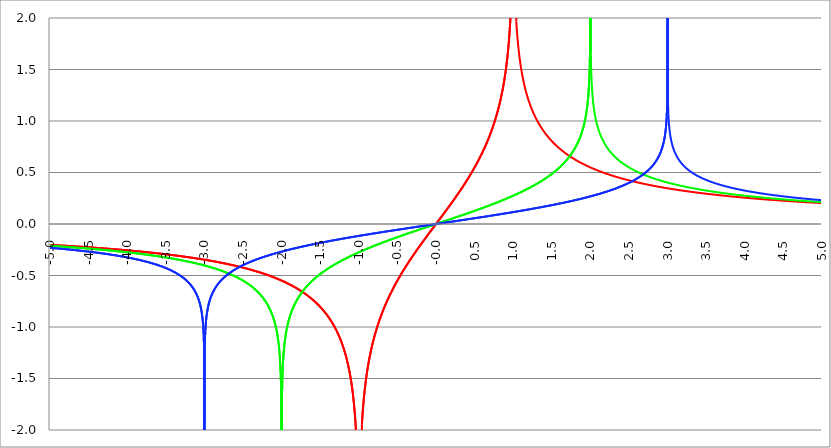
| Category | Series 1 | Series 0 | Series 2 |
|---|---|---|---|
| -5.0 | -0.203 | -0.212 | -0.231 |
| -4.995 | -0.203 | -0.212 | -0.231 |
| -4.99 | -0.203 | -0.212 | -0.232 |
| -4.985 | -0.203 | -0.213 | -0.232 |
| -4.98 | -0.204 | -0.213 | -0.232 |
| -4.975 | -0.204 | -0.213 | -0.233 |
| -4.97 | -0.204 | -0.213 | -0.233 |
| -4.965000000000001 | -0.204 | -0.214 | -0.233 |
| -4.960000000000001 | -0.204 | -0.214 | -0.234 |
| -4.955000000000001 | -0.205 | -0.214 | -0.234 |
| -4.950000000000001 | -0.205 | -0.214 | -0.234 |
| -4.945000000000001 | -0.205 | -0.214 | -0.235 |
| -4.940000000000001 | -0.205 | -0.215 | -0.235 |
| -4.935000000000001 | -0.205 | -0.215 | -0.235 |
| -4.930000000000001 | -0.206 | -0.215 | -0.236 |
| -4.925000000000002 | -0.206 | -0.215 | -0.236 |
| -4.920000000000002 | -0.206 | -0.216 | -0.236 |
| -4.915000000000002 | -0.206 | -0.216 | -0.237 |
| -4.910000000000002 | -0.207 | -0.216 | -0.237 |
| -4.905000000000002 | -0.207 | -0.216 | -0.237 |
| -4.900000000000002 | -0.207 | -0.217 | -0.238 |
| -4.895000000000002 | -0.207 | -0.217 | -0.238 |
| -4.890000000000002 | -0.207 | -0.217 | -0.238 |
| -4.885000000000002 | -0.208 | -0.217 | -0.239 |
| -4.880000000000002 | -0.208 | -0.218 | -0.239 |
| -4.875000000000003 | -0.208 | -0.218 | -0.239 |
| -4.870000000000003 | -0.208 | -0.218 | -0.24 |
| -4.865000000000003 | -0.209 | -0.218 | -0.24 |
| -4.860000000000003 | -0.209 | -0.219 | -0.24 |
| -4.855000000000003 | -0.209 | -0.219 | -0.241 |
| -4.850000000000003 | -0.209 | -0.219 | -0.241 |
| -4.845000000000003 | -0.209 | -0.219 | -0.241 |
| -4.840000000000003 | -0.21 | -0.22 | -0.242 |
| -4.835000000000003 | -0.21 | -0.22 | -0.242 |
| -4.830000000000004 | -0.21 | -0.22 | -0.242 |
| -4.825000000000004 | -0.21 | -0.221 | -0.243 |
| -4.820000000000004 | -0.211 | -0.221 | -0.243 |
| -4.815000000000004 | -0.211 | -0.221 | -0.243 |
| -4.810000000000004 | -0.211 | -0.221 | -0.244 |
| -4.805000000000004 | -0.211 | -0.222 | -0.244 |
| -4.800000000000004 | -0.211 | -0.222 | -0.244 |
| -4.795000000000004 | -0.212 | -0.222 | -0.245 |
| -4.790000000000004 | -0.212 | -0.222 | -0.245 |
| -4.785000000000004 | -0.212 | -0.223 | -0.245 |
| -4.780000000000004 | -0.212 | -0.223 | -0.246 |
| -4.775000000000004 | -0.213 | -0.223 | -0.246 |
| -4.770000000000004 | -0.213 | -0.223 | -0.247 |
| -4.765000000000005 | -0.213 | -0.224 | -0.247 |
| -4.760000000000005 | -0.213 | -0.224 | -0.247 |
| -4.755000000000005 | -0.213 | -0.224 | -0.248 |
| -4.750000000000005 | -0.214 | -0.224 | -0.248 |
| -4.745000000000005 | -0.214 | -0.225 | -0.248 |
| -4.740000000000005 | -0.214 | -0.225 | -0.249 |
| -4.735000000000005 | -0.214 | -0.225 | -0.249 |
| -4.730000000000005 | -0.215 | -0.226 | -0.249 |
| -4.725000000000006 | -0.215 | -0.226 | -0.25 |
| -4.720000000000006 | -0.215 | -0.226 | -0.25 |
| -4.715000000000006 | -0.215 | -0.226 | -0.251 |
| -4.710000000000006 | -0.216 | -0.227 | -0.251 |
| -4.705000000000006 | -0.216 | -0.227 | -0.251 |
| -4.700000000000006 | -0.216 | -0.227 | -0.252 |
| -4.695000000000006 | -0.216 | -0.227 | -0.252 |
| -4.690000000000006 | -0.217 | -0.228 | -0.253 |
| -4.685000000000007 | -0.217 | -0.228 | -0.253 |
| -4.680000000000007 | -0.217 | -0.228 | -0.253 |
| -4.675000000000007 | -0.217 | -0.229 | -0.254 |
| -4.670000000000007 | -0.217 | -0.229 | -0.254 |
| -4.665000000000007 | -0.218 | -0.229 | -0.254 |
| -4.660000000000007 | -0.218 | -0.229 | -0.255 |
| -4.655000000000007 | -0.218 | -0.23 | -0.255 |
| -4.650000000000007 | -0.218 | -0.23 | -0.256 |
| -4.645000000000007 | -0.219 | -0.23 | -0.256 |
| -4.640000000000008 | -0.219 | -0.231 | -0.256 |
| -4.635000000000008 | -0.219 | -0.231 | -0.257 |
| -4.630000000000008 | -0.219 | -0.231 | -0.257 |
| -4.625000000000008 | -0.22 | -0.231 | -0.258 |
| -4.620000000000008 | -0.22 | -0.232 | -0.258 |
| -4.615000000000008 | -0.22 | -0.232 | -0.258 |
| -4.610000000000008 | -0.22 | -0.232 | -0.259 |
| -4.605000000000008 | -0.221 | -0.233 | -0.259 |
| -4.600000000000008 | -0.221 | -0.233 | -0.26 |
| -4.595000000000009 | -0.221 | -0.233 | -0.26 |
| -4.590000000000009 | -0.221 | -0.233 | -0.261 |
| -4.585000000000009 | -0.222 | -0.234 | -0.261 |
| -4.580000000000009 | -0.222 | -0.234 | -0.261 |
| -4.57500000000001 | -0.222 | -0.234 | -0.262 |
| -4.57000000000001 | -0.222 | -0.235 | -0.262 |
| -4.565000000000009 | -0.223 | -0.235 | -0.263 |
| -4.560000000000009 | -0.223 | -0.235 | -0.263 |
| -4.555000000000009 | -0.223 | -0.236 | -0.263 |
| -4.55000000000001 | -0.223 | -0.236 | -0.264 |
| -4.54500000000001 | -0.224 | -0.236 | -0.264 |
| -4.54000000000001 | -0.224 | -0.236 | -0.265 |
| -4.53500000000001 | -0.224 | -0.237 | -0.265 |
| -4.53000000000001 | -0.224 | -0.237 | -0.266 |
| -4.52500000000001 | -0.225 | -0.237 | -0.266 |
| -4.52000000000001 | -0.225 | -0.238 | -0.266 |
| -4.51500000000001 | -0.225 | -0.238 | -0.267 |
| -4.51000000000001 | -0.225 | -0.238 | -0.267 |
| -4.505000000000011 | -0.226 | -0.239 | -0.268 |
| -4.500000000000011 | -0.226 | -0.239 | -0.268 |
| -4.495000000000011 | -0.226 | -0.239 | -0.269 |
| -4.490000000000011 | -0.227 | -0.239 | -0.269 |
| -4.485000000000011 | -0.227 | -0.24 | -0.27 |
| -4.480000000000011 | -0.227 | -0.24 | -0.27 |
| -4.475000000000011 | -0.227 | -0.24 | -0.27 |
| -4.470000000000011 | -0.228 | -0.241 | -0.271 |
| -4.465000000000011 | -0.228 | -0.241 | -0.271 |
| -4.460000000000011 | -0.228 | -0.241 | -0.272 |
| -4.455000000000012 | -0.228 | -0.242 | -0.272 |
| -4.450000000000012 | -0.229 | -0.242 | -0.273 |
| -4.445000000000012 | -0.229 | -0.242 | -0.273 |
| -4.440000000000012 | -0.229 | -0.243 | -0.274 |
| -4.435000000000012 | -0.229 | -0.243 | -0.274 |
| -4.430000000000012 | -0.23 | -0.243 | -0.275 |
| -4.425000000000012 | -0.23 | -0.244 | -0.275 |
| -4.420000000000012 | -0.23 | -0.244 | -0.276 |
| -4.415000000000012 | -0.23 | -0.244 | -0.276 |
| -4.410000000000013 | -0.231 | -0.245 | -0.277 |
| -4.405000000000013 | -0.231 | -0.245 | -0.277 |
| -4.400000000000013 | -0.231 | -0.245 | -0.278 |
| -4.395000000000013 | -0.232 | -0.246 | -0.278 |
| -4.390000000000013 | -0.232 | -0.246 | -0.278 |
| -4.385000000000013 | -0.232 | -0.246 | -0.279 |
| -4.380000000000013 | -0.232 | -0.247 | -0.279 |
| -4.375000000000013 | -0.233 | -0.247 | -0.28 |
| -4.370000000000013 | -0.233 | -0.247 | -0.28 |
| -4.365000000000013 | -0.233 | -0.248 | -0.281 |
| -4.360000000000014 | -0.234 | -0.248 | -0.281 |
| -4.355000000000014 | -0.234 | -0.248 | -0.282 |
| -4.350000000000014 | -0.234 | -0.249 | -0.282 |
| -4.345000000000014 | -0.234 | -0.249 | -0.283 |
| -4.340000000000014 | -0.235 | -0.249 | -0.283 |
| -4.335000000000014 | -0.235 | -0.25 | -0.284 |
| -4.330000000000014 | -0.235 | -0.25 | -0.284 |
| -4.325000000000014 | -0.235 | -0.25 | -0.285 |
| -4.320000000000014 | -0.236 | -0.251 | -0.285 |
| -4.315000000000015 | -0.236 | -0.251 | -0.286 |
| -4.310000000000015 | -0.236 | -0.251 | -0.287 |
| -4.305000000000015 | -0.237 | -0.252 | -0.287 |
| -4.300000000000015 | -0.237 | -0.252 | -0.288 |
| -4.295000000000015 | -0.237 | -0.252 | -0.288 |
| -4.290000000000015 | -0.237 | -0.253 | -0.289 |
| -4.285000000000015 | -0.238 | -0.253 | -0.289 |
| -4.280000000000015 | -0.238 | -0.253 | -0.29 |
| -4.275000000000015 | -0.238 | -0.254 | -0.29 |
| -4.270000000000015 | -0.239 | -0.254 | -0.291 |
| -4.265000000000016 | -0.239 | -0.254 | -0.291 |
| -4.260000000000016 | -0.239 | -0.255 | -0.292 |
| -4.255000000000016 | -0.239 | -0.255 | -0.292 |
| -4.250000000000016 | -0.24 | -0.255 | -0.293 |
| -4.245000000000016 | -0.24 | -0.256 | -0.294 |
| -4.240000000000016 | -0.24 | -0.256 | -0.294 |
| -4.235000000000016 | -0.241 | -0.256 | -0.295 |
| -4.230000000000016 | -0.241 | -0.257 | -0.295 |
| -4.225000000000017 | -0.241 | -0.257 | -0.296 |
| -4.220000000000017 | -0.242 | -0.258 | -0.296 |
| -4.215000000000017 | -0.242 | -0.258 | -0.297 |
| -4.210000000000017 | -0.242 | -0.258 | -0.297 |
| -4.205000000000017 | -0.242 | -0.259 | -0.298 |
| -4.200000000000017 | -0.243 | -0.259 | -0.299 |
| -4.195000000000017 | -0.243 | -0.259 | -0.299 |
| -4.190000000000017 | -0.243 | -0.26 | -0.3 |
| -4.185000000000017 | -0.244 | -0.26 | -0.3 |
| -4.180000000000017 | -0.244 | -0.26 | -0.301 |
| -4.175000000000018 | -0.244 | -0.261 | -0.302 |
| -4.170000000000018 | -0.245 | -0.261 | -0.302 |
| -4.165000000000018 | -0.245 | -0.262 | -0.303 |
| -4.160000000000018 | -0.245 | -0.262 | -0.303 |
| -4.155000000000018 | -0.245 | -0.262 | -0.304 |
| -4.150000000000018 | -0.246 | -0.263 | -0.305 |
| -4.145000000000018 | -0.246 | -0.263 | -0.305 |
| -4.140000000000018 | -0.246 | -0.264 | -0.306 |
| -4.135000000000018 | -0.247 | -0.264 | -0.306 |
| -4.130000000000019 | -0.247 | -0.264 | -0.307 |
| -4.125000000000019 | -0.247 | -0.265 | -0.308 |
| -4.120000000000019 | -0.248 | -0.265 | -0.308 |
| -4.115000000000019 | -0.248 | -0.265 | -0.309 |
| -4.110000000000019 | -0.248 | -0.266 | -0.31 |
| -4.105000000000019 | -0.249 | -0.266 | -0.31 |
| -4.100000000000019 | -0.249 | -0.267 | -0.311 |
| -4.095000000000019 | -0.249 | -0.267 | -0.311 |
| -4.090000000000019 | -0.25 | -0.267 | -0.312 |
| -4.085000000000019 | -0.25 | -0.268 | -0.313 |
| -4.08000000000002 | -0.25 | -0.268 | -0.313 |
| -4.07500000000002 | -0.251 | -0.269 | -0.314 |
| -4.07000000000002 | -0.251 | -0.269 | -0.315 |
| -4.06500000000002 | -0.251 | -0.269 | -0.315 |
| -4.06000000000002 | -0.251 | -0.27 | -0.316 |
| -4.05500000000002 | -0.252 | -0.27 | -0.317 |
| -4.05000000000002 | -0.252 | -0.271 | -0.317 |
| -4.04500000000002 | -0.252 | -0.271 | -0.318 |
| -4.04000000000002 | -0.253 | -0.271 | -0.319 |
| -4.03500000000002 | -0.253 | -0.272 | -0.319 |
| -4.03000000000002 | -0.253 | -0.272 | -0.32 |
| -4.025000000000021 | -0.254 | -0.273 | -0.321 |
| -4.020000000000021 | -0.254 | -0.273 | -0.321 |
| -4.015000000000021 | -0.254 | -0.273 | -0.322 |
| -4.010000000000021 | -0.255 | -0.274 | -0.323 |
| -4.005000000000021 | -0.255 | -0.274 | -0.324 |
| -4.000000000000021 | -0.255 | -0.275 | -0.324 |
| -3.995000000000021 | -0.256 | -0.275 | -0.325 |
| -3.990000000000021 | -0.256 | -0.275 | -0.326 |
| -3.985000000000022 | -0.256 | -0.276 | -0.326 |
| -3.980000000000022 | -0.257 | -0.276 | -0.327 |
| -3.975000000000022 | -0.257 | -0.277 | -0.328 |
| -3.970000000000022 | -0.257 | -0.277 | -0.329 |
| -3.965000000000022 | -0.258 | -0.278 | -0.329 |
| -3.960000000000022 | -0.258 | -0.278 | -0.33 |
| -3.955000000000022 | -0.258 | -0.278 | -0.331 |
| -3.950000000000022 | -0.259 | -0.279 | -0.332 |
| -3.945000000000022 | -0.259 | -0.279 | -0.332 |
| -3.940000000000023 | -0.259 | -0.28 | -0.333 |
| -3.935000000000023 | -0.26 | -0.28 | -0.334 |
| -3.930000000000023 | -0.26 | -0.281 | -0.335 |
| -3.925000000000023 | -0.261 | -0.281 | -0.336 |
| -3.920000000000023 | -0.261 | -0.282 | -0.336 |
| -3.915000000000023 | -0.261 | -0.282 | -0.337 |
| -3.910000000000023 | -0.262 | -0.282 | -0.338 |
| -3.905000000000023 | -0.262 | -0.283 | -0.339 |
| -3.900000000000023 | -0.262 | -0.283 | -0.339 |
| -3.895000000000023 | -0.263 | -0.284 | -0.34 |
| -3.890000000000024 | -0.263 | -0.284 | -0.341 |
| -3.885000000000024 | -0.263 | -0.285 | -0.342 |
| -3.880000000000024 | -0.264 | -0.285 | -0.343 |
| -3.875000000000024 | -0.264 | -0.286 | -0.344 |
| -3.870000000000024 | -0.264 | -0.286 | -0.344 |
| -3.865000000000024 | -0.265 | -0.286 | -0.345 |
| -3.860000000000024 | -0.265 | -0.287 | -0.346 |
| -3.855000000000024 | -0.265 | -0.287 | -0.347 |
| -3.850000000000024 | -0.266 | -0.288 | -0.348 |
| -3.845000000000025 | -0.266 | -0.288 | -0.349 |
| -3.840000000000025 | -0.267 | -0.289 | -0.35 |
| -3.835000000000025 | -0.267 | -0.289 | -0.35 |
| -3.830000000000025 | -0.267 | -0.29 | -0.351 |
| -3.825000000000025 | -0.268 | -0.29 | -0.352 |
| -3.820000000000025 | -0.268 | -0.291 | -0.353 |
| -3.815000000000025 | -0.268 | -0.291 | -0.354 |
| -3.810000000000025 | -0.269 | -0.292 | -0.355 |
| -3.805000000000025 | -0.269 | -0.292 | -0.356 |
| -3.800000000000026 | -0.269 | -0.293 | -0.357 |
| -3.795000000000026 | -0.27 | -0.293 | -0.358 |
| -3.790000000000026 | -0.27 | -0.293 | -0.359 |
| -3.785000000000026 | -0.271 | -0.294 | -0.359 |
| -3.780000000000026 | -0.271 | -0.294 | -0.36 |
| -3.775000000000026 | -0.271 | -0.295 | -0.361 |
| -3.770000000000026 | -0.272 | -0.295 | -0.362 |
| -3.765000000000026 | -0.272 | -0.296 | -0.363 |
| -3.760000000000026 | -0.273 | -0.296 | -0.364 |
| -3.755000000000026 | -0.273 | -0.297 | -0.365 |
| -3.750000000000027 | -0.273 | -0.297 | -0.366 |
| -3.745000000000027 | -0.274 | -0.298 | -0.367 |
| -3.740000000000027 | -0.274 | -0.298 | -0.368 |
| -3.735000000000027 | -0.274 | -0.299 | -0.369 |
| -3.730000000000027 | -0.275 | -0.299 | -0.37 |
| -3.725000000000027 | -0.275 | -0.3 | -0.371 |
| -3.720000000000027 | -0.276 | -0.3 | -0.372 |
| -3.715000000000027 | -0.276 | -0.301 | -0.373 |
| -3.710000000000027 | -0.276 | -0.301 | -0.374 |
| -3.705000000000028 | -0.277 | -0.302 | -0.375 |
| -3.700000000000028 | -0.277 | -0.302 | -0.376 |
| -3.695000000000028 | -0.278 | -0.303 | -0.378 |
| -3.690000000000028 | -0.278 | -0.303 | -0.379 |
| -3.685000000000028 | -0.278 | -0.304 | -0.38 |
| -3.680000000000028 | -0.279 | -0.305 | -0.381 |
| -3.675000000000028 | -0.279 | -0.305 | -0.382 |
| -3.670000000000028 | -0.28 | -0.306 | -0.383 |
| -3.665000000000028 | -0.28 | -0.306 | -0.384 |
| -3.660000000000028 | -0.28 | -0.307 | -0.385 |
| -3.655000000000029 | -0.281 | -0.307 | -0.386 |
| -3.650000000000029 | -0.281 | -0.308 | -0.388 |
| -3.645000000000029 | -0.282 | -0.308 | -0.389 |
| -3.640000000000029 | -0.282 | -0.309 | -0.39 |
| -3.635000000000029 | -0.282 | -0.309 | -0.391 |
| -3.630000000000029 | -0.283 | -0.31 | -0.392 |
| -3.625000000000029 | -0.283 | -0.31 | -0.393 |
| -3.620000000000029 | -0.284 | -0.311 | -0.395 |
| -3.615000000000029 | -0.284 | -0.312 | -0.396 |
| -3.61000000000003 | -0.284 | -0.312 | -0.397 |
| -3.60500000000003 | -0.285 | -0.313 | -0.398 |
| -3.60000000000003 | -0.285 | -0.313 | -0.4 |
| -3.59500000000003 | -0.286 | -0.314 | -0.401 |
| -3.59000000000003 | -0.286 | -0.314 | -0.402 |
| -3.58500000000003 | -0.287 | -0.315 | -0.403 |
| -3.58000000000003 | -0.287 | -0.315 | -0.405 |
| -3.57500000000003 | -0.287 | -0.316 | -0.406 |
| -3.57000000000003 | -0.288 | -0.317 | -0.407 |
| -3.565000000000031 | -0.288 | -0.317 | -0.409 |
| -3.560000000000031 | -0.289 | -0.318 | -0.41 |
| -3.555000000000031 | -0.289 | -0.318 | -0.412 |
| -3.550000000000031 | -0.29 | -0.319 | -0.413 |
| -3.545000000000031 | -0.29 | -0.319 | -0.414 |
| -3.540000000000031 | -0.29 | -0.32 | -0.416 |
| -3.535000000000031 | -0.291 | -0.321 | -0.417 |
| -3.530000000000031 | -0.291 | -0.321 | -0.419 |
| -3.525000000000031 | -0.292 | -0.322 | -0.42 |
| -3.520000000000032 | -0.292 | -0.322 | -0.421 |
| -3.515000000000032 | -0.293 | -0.323 | -0.423 |
| -3.510000000000032 | -0.293 | -0.324 | -0.424 |
| -3.505000000000032 | -0.293 | -0.324 | -0.426 |
| -3.500000000000032 | -0.294 | -0.325 | -0.427 |
| -3.495000000000032 | -0.294 | -0.325 | -0.429 |
| -3.490000000000032 | -0.295 | -0.326 | -0.431 |
| -3.485000000000032 | -0.295 | -0.327 | -0.432 |
| -3.480000000000032 | -0.296 | -0.327 | -0.434 |
| -3.475000000000032 | -0.296 | -0.328 | -0.435 |
| -3.470000000000033 | -0.297 | -0.329 | -0.437 |
| -3.465000000000033 | -0.297 | -0.329 | -0.439 |
| -3.460000000000033 | -0.297 | -0.33 | -0.44 |
| -3.455000000000033 | -0.298 | -0.33 | -0.442 |
| -3.450000000000033 | -0.298 | -0.331 | -0.444 |
| -3.445000000000033 | -0.299 | -0.332 | -0.445 |
| -3.440000000000033 | -0.299 | -0.332 | -0.447 |
| -3.435000000000033 | -0.3 | -0.333 | -0.449 |
| -3.430000000000033 | -0.3 | -0.334 | -0.451 |
| -3.425000000000034 | -0.301 | -0.334 | -0.453 |
| -3.420000000000034 | -0.301 | -0.335 | -0.454 |
| -3.415000000000034 | -0.302 | -0.336 | -0.456 |
| -3.410000000000034 | -0.302 | -0.336 | -0.458 |
| -3.405000000000034 | -0.303 | -0.337 | -0.46 |
| -3.400000000000034 | -0.303 | -0.337 | -0.462 |
| -3.395000000000034 | -0.304 | -0.338 | -0.464 |
| -3.390000000000034 | -0.304 | -0.339 | -0.466 |
| -3.385000000000034 | -0.304 | -0.339 | -0.468 |
| -3.380000000000034 | -0.305 | -0.34 | -0.47 |
| -3.375000000000035 | -0.305 | -0.341 | -0.472 |
| -3.370000000000035 | -0.306 | -0.342 | -0.474 |
| -3.365000000000035 | -0.306 | -0.342 | -0.476 |
| -3.360000000000035 | -0.307 | -0.343 | -0.479 |
| -3.355000000000035 | -0.307 | -0.344 | -0.481 |
| -3.350000000000035 | -0.308 | -0.344 | -0.483 |
| -3.345000000000035 | -0.308 | -0.345 | -0.485 |
| -3.340000000000035 | -0.309 | -0.346 | -0.488 |
| -3.335000000000035 | -0.309 | -0.346 | -0.49 |
| -3.330000000000036 | -0.31 | -0.347 | -0.492 |
| -3.325000000000036 | -0.31 | -0.348 | -0.495 |
| -3.320000000000036 | -0.311 | -0.348 | -0.497 |
| -3.315000000000036 | -0.311 | -0.349 | -0.5 |
| -3.310000000000036 | -0.312 | -0.35 | -0.502 |
| -3.305000000000036 | -0.312 | -0.351 | -0.505 |
| -3.300000000000036 | -0.313 | -0.351 | -0.507 |
| -3.295000000000036 | -0.313 | -0.352 | -0.51 |
| -3.290000000000036 | -0.314 | -0.353 | -0.513 |
| -3.285000000000036 | -0.314 | -0.354 | -0.516 |
| -3.280000000000036 | -0.315 | -0.354 | -0.518 |
| -3.275000000000037 | -0.315 | -0.355 | -0.521 |
| -3.270000000000037 | -0.316 | -0.356 | -0.524 |
| -3.265000000000037 | -0.316 | -0.357 | -0.527 |
| -3.260000000000037 | -0.317 | -0.357 | -0.53 |
| -3.255000000000037 | -0.317 | -0.358 | -0.533 |
| -3.250000000000037 | -0.318 | -0.359 | -0.536 |
| -3.245000000000037 | -0.319 | -0.36 | -0.54 |
| -3.240000000000037 | -0.319 | -0.36 | -0.543 |
| -3.235000000000038 | -0.32 | -0.361 | -0.546 |
| -3.230000000000038 | -0.32 | -0.362 | -0.55 |
| -3.225000000000038 | -0.321 | -0.363 | -0.553 |
| -3.220000000000038 | -0.321 | -0.363 | -0.557 |
| -3.215000000000038 | -0.322 | -0.364 | -0.561 |
| -3.210000000000038 | -0.322 | -0.365 | -0.564 |
| -3.205000000000038 | -0.323 | -0.366 | -0.568 |
| -3.200000000000038 | -0.323 | -0.367 | -0.572 |
| -3.195000000000038 | -0.324 | -0.367 | -0.576 |
| -3.190000000000039 | -0.324 | -0.368 | -0.581 |
| -3.185000000000039 | -0.325 | -0.369 | -0.585 |
| -3.180000000000039 | -0.325 | -0.37 | -0.589 |
| -3.175000000000039 | -0.326 | -0.371 | -0.594 |
| -3.170000000000039 | -0.327 | -0.371 | -0.599 |
| -3.16500000000004 | -0.327 | -0.372 | -0.603 |
| -3.16000000000004 | -0.328 | -0.373 | -0.608 |
| -3.155000000000039 | -0.328 | -0.374 | -0.614 |
| -3.150000000000039 | -0.329 | -0.375 | -0.619 |
| -3.14500000000004 | -0.329 | -0.376 | -0.624 |
| -3.14000000000004 | -0.33 | -0.377 | -0.63 |
| -3.13500000000004 | -0.331 | -0.377 | -0.636 |
| -3.13000000000004 | -0.331 | -0.378 | -0.642 |
| -3.12500000000004 | -0.332 | -0.379 | -0.649 |
| -3.12000000000004 | -0.332 | -0.38 | -0.655 |
| -3.11500000000004 | -0.333 | -0.381 | -0.662 |
| -3.11000000000004 | -0.333 | -0.382 | -0.67 |
| -3.10500000000004 | -0.334 | -0.383 | -0.677 |
| -3.10000000000004 | -0.335 | -0.383 | -0.685 |
| -3.095000000000041 | -0.335 | -0.384 | -0.694 |
| -3.090000000000041 | -0.336 | -0.385 | -0.702 |
| -3.085000000000041 | -0.336 | -0.386 | -0.712 |
| -3.080000000000041 | -0.337 | -0.387 | -0.722 |
| -3.075000000000041 | -0.337 | -0.388 | -0.732 |
| -3.070000000000041 | -0.338 | -0.389 | -0.744 |
| -3.065000000000041 | -0.339 | -0.39 | -0.756 |
| -3.060000000000041 | -0.339 | -0.391 | -0.769 |
| -3.055000000000041 | -0.34 | -0.392 | -0.784 |
| -3.050000000000042 | -0.34 | -0.393 | -0.799 |
| -3.045000000000042 | -0.341 | -0.394 | -0.817 |
| -3.040000000000042 | -0.342 | -0.395 | -0.836 |
| -3.035000000000042 | -0.342 | -0.396 | -0.858 |
| -3.030000000000042 | -0.343 | -0.396 | -0.884 |
| -3.025000000000042 | -0.343 | -0.397 | -0.914 |
| -3.020000000000042 | -0.344 | -0.398 | -0.951 |
| -3.015000000000042 | -0.345 | -0.399 | -0.999 |
| -3.010000000000042 | -0.345 | -0.4 | -1.066 |
| -3.005000000000043 | -0.346 | -0.401 | -1.182 |
| -3.000000000000043 | -0.347 | -0.402 | -5.43 |
| -2.995000000000043 | -0.347 | -0.403 | -1.182 |
| -2.990000000000043 | -0.348 | -0.404 | -1.066 |
| -2.985000000000043 | -0.348 | -0.405 | -0.998 |
| -2.980000000000043 | -0.349 | -0.406 | -0.95 |
| -2.975000000000043 | -0.35 | -0.407 | -0.913 |
| -2.970000000000043 | -0.35 | -0.408 | -0.882 |
| -2.965000000000043 | -0.351 | -0.41 | -0.856 |
| -2.960000000000043 | -0.352 | -0.411 | -0.834 |
| -2.955000000000044 | -0.352 | -0.412 | -0.814 |
| -2.950000000000044 | -0.353 | -0.413 | -0.797 |
| -2.945000000000044 | -0.354 | -0.414 | -0.78 |
| -2.940000000000044 | -0.354 | -0.415 | -0.766 |
| -2.935000000000044 | -0.355 | -0.416 | -0.752 |
| -2.930000000000044 | -0.356 | -0.417 | -0.74 |
| -2.925000000000044 | -0.356 | -0.418 | -0.728 |
| -2.920000000000044 | -0.357 | -0.419 | -0.717 |
| -2.915000000000044 | -0.358 | -0.42 | -0.707 |
| -2.910000000000045 | -0.358 | -0.421 | -0.697 |
| -2.905000000000045 | -0.359 | -0.423 | -0.688 |
| -2.900000000000045 | -0.36 | -0.424 | -0.68 |
| -2.895000000000045 | -0.36 | -0.425 | -0.671 |
| -2.890000000000045 | -0.361 | -0.426 | -0.663 |
| -2.885000000000045 | -0.362 | -0.427 | -0.656 |
| -2.880000000000045 | -0.362 | -0.428 | -0.649 |
| -2.875000000000045 | -0.363 | -0.429 | -0.642 |
| -2.870000000000045 | -0.364 | -0.431 | -0.635 |
| -2.865000000000045 | -0.364 | -0.432 | -0.629 |
| -2.860000000000046 | -0.365 | -0.433 | -0.622 |
| -2.855000000000046 | -0.366 | -0.434 | -0.616 |
| -2.850000000000046 | -0.366 | -0.435 | -0.611 |
| -2.845000000000046 | -0.367 | -0.437 | -0.605 |
| -2.840000000000046 | -0.368 | -0.438 | -0.6 |
| -2.835000000000046 | -0.369 | -0.439 | -0.594 |
| -2.830000000000046 | -0.369 | -0.44 | -0.589 |
| -2.825000000000046 | -0.37 | -0.442 | -0.584 |
| -2.820000000000046 | -0.371 | -0.443 | -0.579 |
| -2.815000000000047 | -0.371 | -0.444 | -0.575 |
| -2.810000000000047 | -0.372 | -0.445 | -0.57 |
| -2.805000000000047 | -0.373 | -0.447 | -0.566 |
| -2.800000000000047 | -0.374 | -0.448 | -0.561 |
| -2.795000000000047 | -0.374 | -0.449 | -0.557 |
| -2.790000000000047 | -0.375 | -0.451 | -0.553 |
| -2.785000000000047 | -0.376 | -0.452 | -0.549 |
| -2.780000000000047 | -0.377 | -0.453 | -0.545 |
| -2.775000000000047 | -0.377 | -0.455 | -0.541 |
| -2.770000000000047 | -0.378 | -0.456 | -0.537 |
| -2.765000000000048 | -0.379 | -0.457 | -0.533 |
| -2.760000000000048 | -0.38 | -0.459 | -0.53 |
| -2.755000000000048 | -0.38 | -0.46 | -0.526 |
| -2.750000000000048 | -0.381 | -0.461 | -0.523 |
| -2.745000000000048 | -0.382 | -0.463 | -0.519 |
| -2.740000000000048 | -0.383 | -0.464 | -0.516 |
| -2.735000000000048 | -0.383 | -0.466 | -0.512 |
| -2.730000000000048 | -0.384 | -0.467 | -0.509 |
| -2.725000000000048 | -0.385 | -0.469 | -0.506 |
| -2.720000000000049 | -0.386 | -0.47 | -0.503 |
| -2.715000000000049 | -0.386 | -0.472 | -0.5 |
| -2.710000000000049 | -0.387 | -0.473 | -0.497 |
| -2.705000000000049 | -0.388 | -0.475 | -0.494 |
| -2.700000000000049 | -0.389 | -0.476 | -0.491 |
| -2.695000000000049 | -0.39 | -0.478 | -0.488 |
| -2.690000000000049 | -0.39 | -0.479 | -0.485 |
| -2.685000000000049 | -0.391 | -0.481 | -0.482 |
| -2.680000000000049 | -0.392 | -0.482 | -0.479 |
| -2.675000000000049 | -0.393 | -0.484 | -0.477 |
| -2.67000000000005 | -0.394 | -0.485 | -0.474 |
| -2.66500000000005 | -0.395 | -0.487 | -0.471 |
| -2.66000000000005 | -0.395 | -0.489 | -0.469 |
| -2.65500000000005 | -0.396 | -0.49 | -0.466 |
| -2.65000000000005 | -0.397 | -0.492 | -0.464 |
| -2.64500000000005 | -0.398 | -0.494 | -0.461 |
| -2.64000000000005 | -0.399 | -0.495 | -0.459 |
| -2.63500000000005 | -0.399 | -0.497 | -0.456 |
| -2.63000000000005 | -0.4 | -0.499 | -0.454 |
| -2.625000000000051 | -0.401 | -0.5 | -0.451 |
| -2.620000000000051 | -0.402 | -0.502 | -0.449 |
| -2.615000000000051 | -0.403 | -0.504 | -0.447 |
| -2.610000000000051 | -0.404 | -0.506 | -0.444 |
| -2.605000000000051 | -0.405 | -0.507 | -0.442 |
| -2.600000000000051 | -0.405 | -0.509 | -0.44 |
| -2.595000000000051 | -0.406 | -0.511 | -0.438 |
| -2.590000000000051 | -0.407 | -0.513 | -0.435 |
| -2.585000000000051 | -0.408 | -0.515 | -0.433 |
| -2.580000000000052 | -0.409 | -0.517 | -0.431 |
| -2.575000000000052 | -0.41 | -0.518 | -0.429 |
| -2.570000000000052 | -0.411 | -0.52 | -0.427 |
| -2.565000000000052 | -0.412 | -0.522 | -0.425 |
| -2.560000000000052 | -0.413 | -0.524 | -0.423 |
| -2.555000000000052 | -0.413 | -0.526 | -0.421 |
| -2.550000000000052 | -0.414 | -0.528 | -0.419 |
| -2.545000000000052 | -0.415 | -0.53 | -0.417 |
| -2.540000000000052 | -0.416 | -0.532 | -0.415 |
| -2.535000000000053 | -0.417 | -0.534 | -0.413 |
| -2.530000000000053 | -0.418 | -0.536 | -0.411 |
| -2.525000000000053 | -0.419 | -0.538 | -0.409 |
| -2.520000000000053 | -0.42 | -0.541 | -0.407 |
| -2.515000000000053 | -0.421 | -0.543 | -0.405 |
| -2.510000000000053 | -0.422 | -0.545 | -0.403 |
| -2.505000000000053 | -0.423 | -0.547 | -0.401 |
| -2.500000000000053 | -0.424 | -0.549 | -0.4 |
| -2.495000000000053 | -0.425 | -0.552 | -0.398 |
| -2.490000000000053 | -0.426 | -0.554 | -0.396 |
| -2.485000000000054 | -0.427 | -0.556 | -0.394 |
| -2.480000000000054 | -0.427 | -0.558 | -0.393 |
| -2.475000000000054 | -0.428 | -0.561 | -0.391 |
| -2.470000000000054 | -0.429 | -0.563 | -0.389 |
| -2.465000000000054 | -0.43 | -0.565 | -0.387 |
| -2.460000000000054 | -0.431 | -0.568 | -0.386 |
| -2.455000000000054 | -0.432 | -0.57 | -0.384 |
| -2.450000000000054 | -0.433 | -0.573 | -0.382 |
| -2.445000000000054 | -0.434 | -0.575 | -0.381 |
| -2.440000000000055 | -0.435 | -0.578 | -0.379 |
| -2.435000000000055 | -0.436 | -0.58 | -0.377 |
| -2.430000000000055 | -0.437 | -0.583 | -0.376 |
| -2.425000000000055 | -0.438 | -0.586 | -0.374 |
| -2.420000000000055 | -0.439 | -0.588 | -0.372 |
| -2.415000000000055 | -0.441 | -0.591 | -0.371 |
| -2.410000000000055 | -0.442 | -0.594 | -0.369 |
| -2.405000000000055 | -0.443 | -0.597 | -0.368 |
| -2.400000000000055 | -0.444 | -0.599 | -0.366 |
| -2.395000000000055 | -0.445 | -0.602 | -0.365 |
| -2.390000000000056 | -0.446 | -0.605 | -0.363 |
| -2.385000000000056 | -0.447 | -0.608 | -0.362 |
| -2.380000000000056 | -0.448 | -0.611 | -0.36 |
| -2.375000000000056 | -0.449 | -0.614 | -0.359 |
| -2.370000000000056 | -0.45 | -0.617 | -0.357 |
| -2.365000000000056 | -0.451 | -0.62 | -0.356 |
| -2.360000000000056 | -0.452 | -0.624 | -0.354 |
| -2.355000000000056 | -0.453 | -0.627 | -0.353 |
| -2.350000000000056 | -0.454 | -0.63 | -0.351 |
| -2.345000000000057 | -0.456 | -0.633 | -0.35 |
| -2.340000000000057 | -0.457 | -0.637 | -0.348 |
| -2.335000000000057 | -0.458 | -0.64 | -0.347 |
| -2.330000000000057 | -0.459 | -0.644 | -0.346 |
| -2.325000000000057 | -0.46 | -0.647 | -0.344 |
| -2.320000000000057 | -0.461 | -0.651 | -0.343 |
| -2.315000000000057 | -0.462 | -0.654 | -0.341 |
| -2.310000000000057 | -0.463 | -0.658 | -0.34 |
| -2.305000000000057 | -0.465 | -0.662 | -0.339 |
| -2.300000000000058 | -0.466 | -0.666 | -0.337 |
| -2.295000000000058 | -0.467 | -0.67 | -0.336 |
| -2.290000000000058 | -0.468 | -0.674 | -0.335 |
| -2.285000000000058 | -0.469 | -0.678 | -0.333 |
| -2.280000000000058 | -0.47 | -0.682 | -0.332 |
| -2.275000000000058 | -0.472 | -0.686 | -0.331 |
| -2.270000000000058 | -0.473 | -0.69 | -0.329 |
| -2.265000000000058 | -0.474 | -0.695 | -0.328 |
| -2.260000000000058 | -0.475 | -0.699 | -0.327 |
| -2.255000000000058 | -0.477 | -0.704 | -0.326 |
| -2.250000000000059 | -0.478 | -0.708 | -0.324 |
| -2.245000000000059 | -0.479 | -0.713 | -0.323 |
| -2.240000000000059 | -0.48 | -0.718 | -0.322 |
| -2.235000000000059 | -0.481 | -0.723 | -0.321 |
| -2.23000000000006 | -0.483 | -0.728 | -0.319 |
| -2.22500000000006 | -0.484 | -0.733 | -0.318 |
| -2.22000000000006 | -0.485 | -0.738 | -0.317 |
| -2.215000000000059 | -0.487 | -0.744 | -0.316 |
| -2.210000000000059 | -0.488 | -0.75 | -0.314 |
| -2.20500000000006 | -0.489 | -0.755 | -0.313 |
| -2.20000000000006 | -0.49 | -0.761 | -0.312 |
| -2.19500000000006 | -0.492 | -0.767 | -0.311 |
| -2.19000000000006 | -0.493 | -0.773 | -0.31 |
| -2.18500000000006 | -0.494 | -0.78 | -0.308 |
| -2.18000000000006 | -0.496 | -0.786 | -0.307 |
| -2.17500000000006 | -0.497 | -0.793 | -0.306 |
| -2.17000000000006 | -0.498 | -0.8 | -0.305 |
| -2.16500000000006 | -0.5 | -0.807 | -0.304 |
| -2.160000000000061 | -0.501 | -0.815 | -0.303 |
| -2.155000000000061 | -0.502 | -0.822 | -0.301 |
| -2.150000000000061 | -0.504 | -0.83 | -0.3 |
| -2.145000000000061 | -0.505 | -0.838 | -0.299 |
| -2.140000000000061 | -0.507 | -0.847 | -0.298 |
| -2.135000000000061 | -0.508 | -0.855 | -0.297 |
| -2.130000000000061 | -0.509 | -0.865 | -0.296 |
| -2.125000000000061 | -0.511 | -0.874 | -0.295 |
| -2.120000000000061 | -0.512 | -0.884 | -0.293 |
| -2.115000000000061 | -0.514 | -0.894 | -0.292 |
| -2.110000000000062 | -0.515 | -0.905 | -0.291 |
| -2.105000000000062 | -0.517 | -0.917 | -0.29 |
| -2.100000000000062 | -0.518 | -0.928 | -0.289 |
| -2.095000000000062 | -0.52 | -0.941 | -0.288 |
| -2.090000000000062 | -0.521 | -0.954 | -0.287 |
| -2.085000000000062 | -0.522 | -0.968 | -0.286 |
| -2.080000000000062 | -0.524 | -0.983 | -0.285 |
| -2.075000000000062 | -0.525 | -0.999 | -0.284 |
| -2.070000000000062 | -0.527 | -1.016 | -0.283 |
| -2.065000000000063 | -0.529 | -1.034 | -0.282 |
| -2.060000000000063 | -0.53 | -1.054 | -0.281 |
| -2.055000000000063 | -0.532 | -1.075 | -0.279 |
| -2.050000000000063 | -0.533 | -1.099 | -0.278 |
| -2.045000000000063 | -0.535 | -1.125 | -0.277 |
| -2.040000000000063 | -0.536 | -1.154 | -0.276 |
| -2.035000000000063 | -0.538 | -1.187 | -0.275 |
| -2.030000000000063 | -0.54 | -1.225 | -0.274 |
| -2.025000000000063 | -0.541 | -1.27 | -0.273 |
| -2.020000000000064 | -0.543 | -1.326 | -0.272 |
| -2.015000000000064 | -0.544 | -1.397 | -0.271 |
| -2.010000000000064 | -0.546 | -1.498 | -0.27 |
| -2.005000000000064 | -0.548 | -1.671 | -0.269 |
| -2.000000000000064 | -0.549 | -7.942 | -0.268 |
| -1.995000000000064 | -0.551 | -1.671 | -0.267 |
| -1.990000000000064 | -0.553 | -1.497 | -0.266 |
| -1.985000000000064 | -0.554 | -1.396 | -0.265 |
| -1.980000000000064 | -0.556 | -1.323 | -0.264 |
| -1.975000000000064 | -0.558 | -1.267 | -0.263 |
| -1.970000000000065 | -0.56 | -1.221 | -0.262 |
| -1.965000000000065 | -0.561 | -1.182 | -0.261 |
| -1.960000000000065 | -0.563 | -1.149 | -0.26 |
| -1.955000000000065 | -0.565 | -1.119 | -0.259 |
| -1.950000000000065 | -0.567 | -1.092 | -0.258 |
| -1.945000000000065 | -0.568 | -1.068 | -0.257 |
| -1.940000000000065 | -0.57 | -1.046 | -0.257 |
| -1.935000000000065 | -0.572 | -1.026 | -0.256 |
| -1.930000000000065 | -0.574 | -1.007 | -0.255 |
| -1.925000000000066 | -0.576 | -0.989 | -0.254 |
| -1.920000000000066 | -0.577 | -0.973 | -0.253 |
| -1.915000000000066 | -0.579 | -0.957 | -0.252 |
| -1.910000000000066 | -0.581 | -0.943 | -0.251 |
| -1.905000000000066 | -0.583 | -0.929 | -0.25 |
| -1.900000000000066 | -0.585 | -0.916 | -0.249 |
| -1.895000000000066 | -0.587 | -0.903 | -0.248 |
| -1.890000000000066 | -0.589 | -0.891 | -0.247 |
| -1.885000000000066 | -0.591 | -0.88 | -0.246 |
| -1.880000000000066 | -0.593 | -0.869 | -0.245 |
| -1.875000000000067 | -0.595 | -0.858 | -0.244 |
| -1.870000000000067 | -0.597 | -0.848 | -0.243 |
| -1.865000000000067 | -0.599 | -0.839 | -0.243 |
| -1.860000000000067 | -0.601 | -0.829 | -0.242 |
| -1.855000000000067 | -0.603 | -0.82 | -0.241 |
| -1.850000000000067 | -0.605 | -0.811 | -0.24 |
| -1.845000000000067 | -0.607 | -0.803 | -0.239 |
| -1.840000000000067 | -0.609 | -0.795 | -0.238 |
| -1.835000000000067 | -0.611 | -0.786 | -0.237 |
| -1.830000000000068 | -0.613 | -0.779 | -0.236 |
| -1.825000000000068 | -0.615 | -0.771 | -0.235 |
| -1.820000000000068 | -0.618 | -0.764 | -0.235 |
| -1.815000000000068 | -0.62 | -0.757 | -0.234 |
| -1.810000000000068 | -0.622 | -0.75 | -0.233 |
| -1.805000000000068 | -0.624 | -0.743 | -0.232 |
| -1.800000000000068 | -0.626 | -0.736 | -0.231 |
| -1.795000000000068 | -0.629 | -0.73 | -0.23 |
| -1.790000000000068 | -0.631 | -0.723 | -0.229 |
| -1.785000000000068 | -0.633 | -0.717 | -0.228 |
| -1.780000000000069 | -0.635 | -0.711 | -0.228 |
| -1.775000000000069 | -0.638 | -0.705 | -0.227 |
| -1.770000000000069 | -0.64 | -0.699 | -0.226 |
| -1.765000000000069 | -0.642 | -0.693 | -0.225 |
| -1.760000000000069 | -0.645 | -0.688 | -0.224 |
| -1.75500000000007 | -0.647 | -0.682 | -0.223 |
| -1.75000000000007 | -0.65 | -0.677 | -0.223 |
| -1.745000000000069 | -0.652 | -0.672 | -0.222 |
| -1.740000000000069 | -0.655 | -0.667 | -0.221 |
| -1.73500000000007 | -0.657 | -0.661 | -0.22 |
| -1.73000000000007 | -0.66 | -0.656 | -0.219 |
| -1.72500000000007 | -0.662 | -0.652 | -0.218 |
| -1.72000000000007 | -0.665 | -0.647 | -0.217 |
| -1.71500000000007 | -0.667 | -0.642 | -0.217 |
| -1.71000000000007 | -0.67 | -0.637 | -0.216 |
| -1.70500000000007 | -0.672 | -0.633 | -0.215 |
| -1.70000000000007 | -0.675 | -0.628 | -0.214 |
| -1.69500000000007 | -0.678 | -0.624 | -0.213 |
| -1.69000000000007 | -0.68 | -0.619 | -0.213 |
| -1.685000000000071 | -0.683 | -0.615 | -0.212 |
| -1.680000000000071 | -0.686 | -0.611 | -0.211 |
| -1.675000000000071 | -0.688 | -0.606 | -0.21 |
| -1.670000000000071 | -0.691 | -0.602 | -0.209 |
| -1.665000000000071 | -0.694 | -0.598 | -0.209 |
| -1.660000000000071 | -0.697 | -0.594 | -0.208 |
| -1.655000000000071 | -0.7 | -0.59 | -0.207 |
| -1.650000000000071 | -0.703 | -0.586 | -0.206 |
| -1.645000000000071 | -0.706 | -0.582 | -0.205 |
| -1.640000000000072 | -0.709 | -0.578 | -0.205 |
| -1.635000000000072 | -0.712 | -0.575 | -0.204 |
| -1.630000000000072 | -0.715 | -0.571 | -0.203 |
| -1.625000000000072 | -0.718 | -0.567 | -0.202 |
| -1.620000000000072 | -0.721 | -0.564 | -0.201 |
| -1.615000000000072 | -0.724 | -0.56 | -0.201 |
| -1.610000000000072 | -0.727 | -0.556 | -0.2 |
| -1.605000000000072 | -0.73 | -0.553 | -0.199 |
| -1.600000000000072 | -0.733 | -0.549 | -0.198 |
| -1.595000000000073 | -0.736 | -0.546 | -0.197 |
| -1.590000000000073 | -0.74 | -0.542 | -0.197 |
| -1.585000000000073 | -0.743 | -0.539 | -0.196 |
| -1.580000000000073 | -0.746 | -0.536 | -0.195 |
| -1.575000000000073 | -0.75 | -0.532 | -0.194 |
| -1.570000000000073 | -0.753 | -0.529 | -0.194 |
| -1.565000000000073 | -0.756 | -0.526 | -0.193 |
| -1.560000000000073 | -0.76 | -0.523 | -0.192 |
| -1.555000000000073 | -0.763 | -0.52 | -0.191 |
| -1.550000000000074 | -0.767 | -0.516 | -0.191 |
| -1.545000000000074 | -0.771 | -0.513 | -0.19 |
| -1.540000000000074 | -0.774 | -0.51 | -0.189 |
| -1.535000000000074 | -0.778 | -0.507 | -0.188 |
| -1.530000000000074 | -0.782 | -0.504 | -0.188 |
| -1.525000000000074 | -0.785 | -0.501 | -0.187 |
| -1.520000000000074 | -0.789 | -0.498 | -0.186 |
| -1.515000000000074 | -0.793 | -0.495 | -0.185 |
| -1.510000000000074 | -0.797 | -0.492 | -0.185 |
| -1.505000000000074 | -0.801 | -0.489 | -0.184 |
| -1.500000000000075 | -0.805 | -0.486 | -0.183 |
| -1.495000000000075 | -0.809 | -0.484 | -0.182 |
| -1.490000000000075 | -0.813 | -0.481 | -0.182 |
| -1.485000000000075 | -0.817 | -0.478 | -0.181 |
| -1.480000000000075 | -0.821 | -0.475 | -0.18 |
| -1.475000000000075 | -0.825 | -0.472 | -0.179 |
| -1.470000000000075 | -0.83 | -0.47 | -0.179 |
| -1.465000000000075 | -0.834 | -0.467 | -0.178 |
| -1.460000000000075 | -0.838 | -0.464 | -0.177 |
| -1.455000000000076 | -0.843 | -0.462 | -0.177 |
| -1.450000000000076 | -0.847 | -0.459 | -0.176 |
| -1.445000000000076 | -0.852 | -0.456 | -0.175 |
| -1.440000000000076 | -0.856 | -0.454 | -0.174 |
| -1.435000000000076 | -0.861 | -0.451 | -0.174 |
| -1.430000000000076 | -0.866 | -0.449 | -0.173 |
| -1.425000000000076 | -0.871 | -0.446 | -0.172 |
| -1.420000000000076 | -0.876 | -0.444 | -0.171 |
| -1.415000000000076 | -0.881 | -0.441 | -0.171 |
| -1.410000000000077 | -0.886 | -0.439 | -0.17 |
| -1.405000000000077 | -0.891 | -0.436 | -0.169 |
| -1.400000000000077 | -0.896 | -0.434 | -0.169 |
| -1.395000000000077 | -0.901 | -0.431 | -0.168 |
| -1.390000000000077 | -0.906 | -0.429 | -0.167 |
| -1.385000000000077 | -0.912 | -0.426 | -0.166 |
| -1.380000000000077 | -0.917 | -0.424 | -0.166 |
| -1.375000000000077 | -0.923 | -0.422 | -0.165 |
| -1.370000000000077 | -0.929 | -0.419 | -0.164 |
| -1.365000000000077 | -0.934 | -0.417 | -0.164 |
| -1.360000000000078 | -0.94 | -0.415 | -0.163 |
| -1.355000000000078 | -0.946 | -0.412 | -0.162 |
| -1.350000000000078 | -0.952 | -0.41 | -0.162 |
| -1.345000000000078 | -0.958 | -0.408 | -0.161 |
| -1.340000000000078 | -0.964 | -0.405 | -0.16 |
| -1.335000000000078 | -0.971 | -0.403 | -0.159 |
| -1.330000000000078 | -0.977 | -0.401 | -0.159 |
| -1.325000000000078 | -0.984 | -0.399 | -0.158 |
| -1.320000000000078 | -0.991 | -0.396 | -0.157 |
| -1.315000000000079 | -0.997 | -0.394 | -0.157 |
| -1.310000000000079 | -1.004 | -0.392 | -0.156 |
| -1.305000000000079 | -1.011 | -0.39 | -0.155 |
| -1.300000000000079 | -1.018 | -0.388 | -0.155 |
| -1.295000000000079 | -1.026 | -0.385 | -0.154 |
| -1.29000000000008 | -1.033 | -0.383 | -0.153 |
| -1.285000000000079 | -1.041 | -0.381 | -0.153 |
| -1.280000000000079 | -1.049 | -0.379 | -0.152 |
| -1.275000000000079 | -1.056 | -0.377 | -0.151 |
| -1.270000000000079 | -1.065 | -0.375 | -0.151 |
| -1.26500000000008 | -1.073 | -0.373 | -0.15 |
| -1.26000000000008 | -1.081 | -0.371 | -0.149 |
| -1.25500000000008 | -1.09 | -0.369 | -0.149 |
| -1.25000000000008 | -1.099 | -0.367 | -0.148 |
| -1.24500000000008 | -1.108 | -0.365 | -0.147 |
| -1.24000000000008 | -1.117 | -0.363 | -0.147 |
| -1.23500000000008 | -1.126 | -0.36 | -0.146 |
| -1.23000000000008 | -1.136 | -0.358 | -0.145 |
| -1.22500000000008 | -1.146 | -0.356 | -0.145 |
| -1.220000000000081 | -1.156 | -0.354 | -0.144 |
| -1.215000000000081 | -1.166 | -0.352 | -0.143 |
| -1.210000000000081 | -1.177 | -0.35 | -0.143 |
| -1.205000000000081 | -1.188 | -0.349 | -0.142 |
| -1.200000000000081 | -1.199 | -0.347 | -0.141 |
| -1.195000000000081 | -1.21 | -0.345 | -0.141 |
| -1.190000000000081 | -1.222 | -0.343 | -0.14 |
| -1.185000000000081 | -1.235 | -0.341 | -0.139 |
| -1.180000000000081 | -1.247 | -0.339 | -0.139 |
| -1.175000000000082 | -1.26 | -0.337 | -0.138 |
| -1.170000000000082 | -1.273 | -0.335 | -0.137 |
| -1.165000000000082 | -1.287 | -0.333 | -0.137 |
| -1.160000000000082 | -1.301 | -0.331 | -0.136 |
| -1.155000000000082 | -1.316 | -0.329 | -0.135 |
| -1.150000000000082 | -1.331 | -0.327 | -0.135 |
| -1.145000000000082 | -1.347 | -0.326 | -0.134 |
| -1.140000000000082 | -1.363 | -0.324 | -0.133 |
| -1.135000000000082 | -1.38 | -0.322 | -0.133 |
| -1.130000000000082 | -1.398 | -0.32 | -0.132 |
| -1.125000000000083 | -1.417 | -0.318 | -0.131 |
| -1.120000000000083 | -1.436 | -0.316 | -0.131 |
| -1.115000000000083 | -1.456 | -0.315 | -0.13 |
| -1.110000000000083 | -1.477 | -0.313 | -0.129 |
| -1.105000000000083 | -1.499 | -0.311 | -0.129 |
| -1.100000000000083 | -1.522 | -0.309 | -0.128 |
| -1.095000000000083 | -1.547 | -0.307 | -0.128 |
| -1.090000000000083 | -1.573 | -0.306 | -0.127 |
| -1.085000000000083 | -1.6 | -0.304 | -0.126 |
| -1.080000000000084 | -1.629 | -0.302 | -0.126 |
| -1.075000000000084 | -1.66 | -0.3 | -0.125 |
| -1.070000000000084 | -1.693 | -0.299 | -0.124 |
| -1.065000000000084 | -1.729 | -0.297 | -0.124 |
| -1.060000000000084 | -1.768 | -0.295 | -0.123 |
| -1.055000000000084 | -1.81 | -0.293 | -0.122 |
| -1.050000000000084 | -1.857 | -0.292 | -0.122 |
| -1.045000000000084 | -1.908 | -0.29 | -0.121 |
| -1.040000000000084 | -1.966 | -0.288 | -0.121 |
| -1.035000000000085 | -2.031 | -0.286 | -0.12 |
| -1.030000000000085 | -2.107 | -0.285 | -0.119 |
| -1.025000000000085 | -2.197 | -0.283 | -0.119 |
| -1.020000000000085 | -2.308 | -0.281 | -0.118 |
| -1.015000000000085 | -2.45 | -0.28 | -0.117 |
| -1.010000000000085 | -2.652 | -0.278 | -0.117 |
| -1.005000000000085 | -2.997 | -0.276 | -0.116 |
| -1.000000000000085 | -15.393 | -0.275 | -0.116 |
| -0.995000000000085 | -2.994 | -0.273 | -0.115 |
| -0.990000000000085 | -2.647 | -0.271 | -0.114 |
| -0.985000000000085 | -2.443 | -0.27 | -0.114 |
| -0.980000000000085 | -2.298 | -0.268 | -0.113 |
| -0.975000000000085 | -2.185 | -0.266 | -0.112 |
| -0.970000000000085 | -2.092 | -0.265 | -0.112 |
| -0.965000000000085 | -2.014 | -0.263 | -0.111 |
| -0.960000000000085 | -1.946 | -0.261 | -0.111 |
| -0.955000000000085 | -1.886 | -0.26 | -0.11 |
| -0.950000000000085 | -1.832 | -0.258 | -0.109 |
| -0.945000000000085 | -1.783 | -0.257 | -0.109 |
| -0.940000000000085 | -1.738 | -0.255 | -0.108 |
| -0.935000000000085 | -1.697 | -0.253 | -0.107 |
| -0.930000000000085 | -1.658 | -0.252 | -0.107 |
| -0.925000000000085 | -1.623 | -0.25 | -0.106 |
| -0.920000000000085 | -1.589 | -0.249 | -0.106 |
| -0.915000000000085 | -1.557 | -0.247 | -0.105 |
| -0.910000000000085 | -1.528 | -0.245 | -0.104 |
| -0.905000000000085 | -1.499 | -0.244 | -0.104 |
| -0.900000000000085 | -1.472 | -0.242 | -0.103 |
| -0.895000000000085 | -1.447 | -0.241 | -0.103 |
| -0.890000000000085 | -1.422 | -0.239 | -0.102 |
| -0.885000000000085 | -1.398 | -0.238 | -0.101 |
| -0.880000000000085 | -1.376 | -0.236 | -0.101 |
| -0.875000000000085 | -1.354 | -0.235 | -0.1 |
| -0.870000000000085 | -1.333 | -0.233 | -0.1 |
| -0.865000000000085 | -1.313 | -0.231 | -0.099 |
| -0.860000000000085 | -1.293 | -0.23 | -0.098 |
| -0.855000000000085 | -1.274 | -0.228 | -0.098 |
| -0.850000000000085 | -1.256 | -0.227 | -0.097 |
| -0.845000000000085 | -1.238 | -0.225 | -0.096 |
| -0.840000000000085 | -1.221 | -0.224 | -0.096 |
| -0.835000000000085 | -1.204 | -0.222 | -0.095 |
| -0.830000000000085 | -1.188 | -0.221 | -0.095 |
| -0.825000000000085 | -1.172 | -0.219 | -0.094 |
| -0.820000000000085 | -1.157 | -0.218 | -0.093 |
| -0.815000000000085 | -1.142 | -0.216 | -0.093 |
| -0.810000000000085 | -1.127 | -0.215 | -0.092 |
| -0.805000000000085 | -1.113 | -0.213 | -0.092 |
| -0.800000000000085 | -1.099 | -0.212 | -0.091 |
| -0.795000000000085 | -1.085 | -0.21 | -0.09 |
| -0.790000000000085 | -1.071 | -0.209 | -0.09 |
| -0.785000000000085 | -1.058 | -0.207 | -0.089 |
| -0.780000000000085 | -1.045 | -0.206 | -0.089 |
| -0.775000000000085 | -1.033 | -0.204 | -0.088 |
| -0.770000000000085 | -1.02 | -0.203 | -0.088 |
| -0.765000000000085 | -1.008 | -0.201 | -0.087 |
| -0.760000000000085 | -0.996 | -0.2 | -0.086 |
| -0.755000000000085 | -0.984 | -0.199 | -0.086 |
| -0.750000000000085 | -0.973 | -0.197 | -0.085 |
| -0.745000000000085 | -0.962 | -0.196 | -0.085 |
| -0.740000000000085 | -0.95 | -0.194 | -0.084 |
| -0.735000000000085 | -0.94 | -0.193 | -0.083 |
| -0.730000000000085 | -0.929 | -0.191 | -0.083 |
| -0.725000000000085 | -0.918 | -0.19 | -0.082 |
| -0.720000000000085 | -0.908 | -0.188 | -0.082 |
| -0.715000000000085 | -0.897 | -0.187 | -0.081 |
| -0.710000000000085 | -0.887 | -0.186 | -0.08 |
| -0.705000000000085 | -0.877 | -0.184 | -0.08 |
| -0.700000000000085 | -0.867 | -0.183 | -0.079 |
| -0.695000000000085 | -0.858 | -0.181 | -0.079 |
| -0.690000000000085 | -0.848 | -0.18 | -0.078 |
| -0.685000000000085 | -0.838 | -0.178 | -0.077 |
| -0.680000000000085 | -0.829 | -0.177 | -0.077 |
| -0.675000000000085 | -0.82 | -0.176 | -0.076 |
| -0.670000000000085 | -0.811 | -0.174 | -0.076 |
| -0.665000000000085 | -0.802 | -0.173 | -0.075 |
| -0.660000000000085 | -0.793 | -0.171 | -0.075 |
| -0.655000000000085 | -0.784 | -0.17 | -0.074 |
| -0.650000000000085 | -0.775 | -0.169 | -0.073 |
| -0.645000000000085 | -0.767 | -0.167 | -0.073 |
| -0.640000000000085 | -0.758 | -0.166 | -0.072 |
| -0.635000000000085 | -0.75 | -0.164 | -0.072 |
| -0.630000000000085 | -0.741 | -0.163 | -0.071 |
| -0.625000000000085 | -0.733 | -0.162 | -0.07 |
| -0.620000000000085 | -0.725 | -0.16 | -0.07 |
| -0.615000000000085 | -0.717 | -0.159 | -0.069 |
| -0.610000000000085 | -0.709 | -0.158 | -0.069 |
| -0.605000000000085 | -0.701 | -0.156 | -0.068 |
| -0.600000000000085 | -0.693 | -0.155 | -0.068 |
| -0.595000000000085 | -0.685 | -0.153 | -0.067 |
| -0.590000000000085 | -0.678 | -0.152 | -0.066 |
| -0.585000000000085 | -0.67 | -0.151 | -0.066 |
| -0.580000000000085 | -0.662 | -0.149 | -0.065 |
| -0.575000000000085 | -0.655 | -0.148 | -0.065 |
| -0.570000000000085 | -0.648 | -0.147 | -0.064 |
| -0.565000000000085 | -0.64 | -0.145 | -0.064 |
| -0.560000000000085 | -0.633 | -0.144 | -0.063 |
| -0.555000000000085 | -0.626 | -0.142 | -0.062 |
| -0.550000000000085 | -0.618 | -0.141 | -0.062 |
| -0.545000000000085 | -0.611 | -0.14 | -0.061 |
| -0.540000000000085 | -0.604 | -0.138 | -0.061 |
| -0.535000000000085 | -0.597 | -0.137 | -0.06 |
| -0.530000000000085 | -0.59 | -0.136 | -0.06 |
| -0.525000000000085 | -0.583 | -0.134 | -0.059 |
| -0.520000000000085 | -0.576 | -0.133 | -0.058 |
| -0.515000000000085 | -0.57 | -0.132 | -0.058 |
| -0.510000000000085 | -0.563 | -0.13 | -0.057 |
| -0.505000000000085 | -0.556 | -0.129 | -0.057 |
| -0.500000000000085 | -0.549 | -0.128 | -0.056 |
| -0.495000000000085 | -0.543 | -0.126 | -0.056 |
| -0.490000000000085 | -0.536 | -0.125 | -0.055 |
| -0.485000000000085 | -0.53 | -0.124 | -0.054 |
| -0.480000000000085 | -0.523 | -0.122 | -0.054 |
| -0.475000000000085 | -0.517 | -0.121 | -0.053 |
| -0.470000000000085 | -0.51 | -0.12 | -0.053 |
| -0.465000000000085 | -0.504 | -0.118 | -0.052 |
| -0.460000000000085 | -0.497 | -0.117 | -0.052 |
| -0.455000000000085 | -0.491 | -0.116 | -0.051 |
| -0.450000000000085 | -0.485 | -0.114 | -0.05 |
| -0.445000000000085 | -0.478 | -0.113 | -0.05 |
| -0.440000000000085 | -0.472 | -0.112 | -0.049 |
| -0.435000000000085 | -0.466 | -0.111 | -0.049 |
| -0.430000000000085 | -0.46 | -0.109 | -0.048 |
| -0.425000000000085 | -0.454 | -0.108 | -0.048 |
| -0.420000000000085 | -0.448 | -0.107 | -0.047 |
| -0.415000000000085 | -0.442 | -0.105 | -0.046 |
| -0.410000000000085 | -0.436 | -0.104 | -0.046 |
| -0.405000000000085 | -0.43 | -0.103 | -0.045 |
| -0.400000000000085 | -0.424 | -0.101 | -0.045 |
| -0.395000000000085 | -0.418 | -0.1 | -0.044 |
| -0.390000000000085 | -0.412 | -0.099 | -0.044 |
| -0.385000000000085 | -0.406 | -0.097 | -0.043 |
| -0.380000000000085 | -0.4 | -0.096 | -0.042 |
| -0.375000000000085 | -0.394 | -0.095 | -0.042 |
| -0.370000000000085 | -0.388 | -0.094 | -0.041 |
| -0.365000000000085 | -0.383 | -0.092 | -0.041 |
| -0.360000000000085 | -0.377 | -0.091 | -0.04 |
| -0.355000000000085 | -0.371 | -0.09 | -0.04 |
| -0.350000000000085 | -0.365 | -0.088 | -0.039 |
| -0.345000000000085 | -0.36 | -0.087 | -0.039 |
| -0.340000000000085 | -0.354 | -0.086 | -0.038 |
| -0.335000000000085 | -0.348 | -0.085 | -0.037 |
| -0.330000000000085 | -0.343 | -0.083 | -0.037 |
| -0.325000000000085 | -0.337 | -0.082 | -0.036 |
| -0.320000000000085 | -0.332 | -0.081 | -0.036 |
| -0.315000000000085 | -0.326 | -0.079 | -0.035 |
| -0.310000000000085 | -0.321 | -0.078 | -0.035 |
| -0.305000000000085 | -0.315 | -0.077 | -0.034 |
| -0.300000000000085 | -0.31 | -0.076 | -0.033 |
| -0.295000000000085 | -0.304 | -0.074 | -0.033 |
| -0.290000000000085 | -0.299 | -0.073 | -0.032 |
| -0.285000000000085 | -0.293 | -0.072 | -0.032 |
| -0.280000000000085 | -0.288 | -0.07 | -0.031 |
| -0.275000000000085 | -0.282 | -0.069 | -0.031 |
| -0.270000000000085 | -0.277 | -0.068 | -0.03 |
| -0.265000000000085 | -0.271 | -0.067 | -0.03 |
| -0.260000000000085 | -0.266 | -0.065 | -0.029 |
| -0.255000000000085 | -0.261 | -0.064 | -0.028 |
| -0.250000000000085 | -0.255 | -0.063 | -0.028 |
| -0.245000000000085 | -0.25 | -0.062 | -0.027 |
| -0.240000000000085 | -0.245 | -0.06 | -0.027 |
| -0.235000000000085 | -0.239 | -0.059 | -0.026 |
| -0.230000000000085 | -0.234 | -0.058 | -0.026 |
| -0.225000000000085 | -0.229 | -0.056 | -0.025 |
| -0.220000000000085 | -0.224 | -0.055 | -0.024 |
| -0.215000000000085 | -0.218 | -0.054 | -0.024 |
| -0.210000000000085 | -0.213 | -0.053 | -0.023 |
| -0.205000000000085 | -0.208 | -0.051 | -0.023 |
| -0.200000000000085 | -0.203 | -0.05 | -0.022 |
| -0.195000000000085 | -0.198 | -0.049 | -0.022 |
| -0.190000000000085 | -0.192 | -0.048 | -0.021 |
| -0.185000000000085 | -0.187 | -0.046 | -0.021 |
| -0.180000000000085 | -0.182 | -0.045 | -0.02 |
| -0.175000000000085 | -0.177 | -0.044 | -0.019 |
| -0.170000000000085 | -0.172 | -0.043 | -0.019 |
| -0.165000000000085 | -0.167 | -0.041 | -0.018 |
| -0.160000000000085 | -0.161 | -0.04 | -0.018 |
| -0.155000000000084 | -0.156 | -0.039 | -0.017 |
| -0.150000000000084 | -0.151 | -0.038 | -0.017 |
| -0.145000000000084 | -0.146 | -0.036 | -0.016 |
| -0.140000000000084 | -0.141 | -0.035 | -0.016 |
| -0.135000000000084 | -0.136 | -0.034 | -0.015 |
| -0.130000000000084 | -0.131 | -0.033 | -0.014 |
| -0.125000000000084 | -0.126 | -0.031 | -0.014 |
| -0.120000000000084 | -0.121 | -0.03 | -0.013 |
| -0.115000000000084 | -0.116 | -0.029 | -0.013 |
| -0.110000000000084 | -0.11 | -0.028 | -0.012 |
| -0.105000000000084 | -0.105 | -0.026 | -0.012 |
| -0.100000000000084 | -0.1 | -0.025 | -0.011 |
| -0.0950000000000844 | -0.095 | -0.024 | -0.011 |
| -0.0900000000000844 | -0.09 | -0.023 | -0.01 |
| -0.0850000000000844 | -0.085 | -0.021 | -0.009 |
| -0.0800000000000844 | -0.08 | -0.02 | -0.009 |
| -0.0750000000000844 | -0.075 | -0.019 | -0.008 |
| -0.0700000000000844 | -0.07 | -0.018 | -0.008 |
| -0.0650000000000844 | -0.065 | -0.016 | -0.007 |
| -0.0600000000000844 | -0.06 | -0.015 | -0.007 |
| -0.0550000000000844 | -0.055 | -0.014 | -0.006 |
| -0.0500000000000844 | -0.05 | -0.013 | -0.006 |
| -0.0450000000000844 | -0.045 | -0.011 | -0.005 |
| -0.0400000000000844 | -0.04 | -0.01 | -0.004 |
| -0.0350000000000844 | -0.035 | -0.009 | -0.004 |
| -0.0300000000000844 | -0.03 | -0.008 | -0.003 |
| -0.0250000000000844 | -0.025 | -0.006 | -0.003 |
| -0.0200000000000844 | -0.02 | -0.005 | -0.002 |
| -0.0150000000000844 | -0.015 | -0.004 | -0.002 |
| -0.0100000000000844 | -0.01 | -0.003 | -0.001 |
| -0.00500000000008444 | -0.005 | -0.001 | -0.001 |
| -8.4444604087075e-14 | 0 | 0 | 0 |
| 0.00499999999991555 | 0.005 | 0.001 | 0.001 |
| 0.00999999999991555 | 0.01 | 0.003 | 0.001 |
| 0.0149999999999156 | 0.015 | 0.004 | 0.002 |
| 0.0199999999999156 | 0.02 | 0.005 | 0.002 |
| 0.0249999999999156 | 0.025 | 0.006 | 0.003 |
| 0.0299999999999156 | 0.03 | 0.008 | 0.003 |
| 0.0349999999999155 | 0.035 | 0.009 | 0.004 |
| 0.0399999999999155 | 0.04 | 0.01 | 0.004 |
| 0.0449999999999155 | 0.045 | 0.011 | 0.005 |
| 0.0499999999999155 | 0.05 | 0.013 | 0.006 |
| 0.0549999999999155 | 0.055 | 0.014 | 0.006 |
| 0.0599999999999155 | 0.06 | 0.015 | 0.007 |
| 0.0649999999999155 | 0.065 | 0.016 | 0.007 |
| 0.0699999999999155 | 0.07 | 0.018 | 0.008 |
| 0.0749999999999155 | 0.075 | 0.019 | 0.008 |
| 0.0799999999999155 | 0.08 | 0.02 | 0.009 |
| 0.0849999999999155 | 0.085 | 0.021 | 0.009 |
| 0.0899999999999155 | 0.09 | 0.023 | 0.01 |
| 0.0949999999999155 | 0.095 | 0.024 | 0.011 |
| 0.0999999999999155 | 0.1 | 0.025 | 0.011 |
| 0.104999999999916 | 0.105 | 0.026 | 0.012 |
| 0.109999999999916 | 0.11 | 0.028 | 0.012 |
| 0.114999999999916 | 0.116 | 0.029 | 0.013 |
| 0.119999999999916 | 0.121 | 0.03 | 0.013 |
| 0.124999999999916 | 0.126 | 0.031 | 0.014 |
| 0.129999999999916 | 0.131 | 0.033 | 0.014 |
| 0.134999999999916 | 0.136 | 0.034 | 0.015 |
| 0.139999999999916 | 0.141 | 0.035 | 0.016 |
| 0.144999999999916 | 0.146 | 0.036 | 0.016 |
| 0.149999999999916 | 0.151 | 0.038 | 0.017 |
| 0.154999999999916 | 0.156 | 0.039 | 0.017 |
| 0.159999999999916 | 0.161 | 0.04 | 0.018 |
| 0.164999999999916 | 0.167 | 0.041 | 0.018 |
| 0.169999999999916 | 0.172 | 0.043 | 0.019 |
| 0.174999999999916 | 0.177 | 0.044 | 0.019 |
| 0.179999999999916 | 0.182 | 0.045 | 0.02 |
| 0.184999999999916 | 0.187 | 0.046 | 0.021 |
| 0.189999999999916 | 0.192 | 0.048 | 0.021 |
| 0.194999999999916 | 0.198 | 0.049 | 0.022 |
| 0.199999999999916 | 0.203 | 0.05 | 0.022 |
| 0.204999999999916 | 0.208 | 0.051 | 0.023 |
| 0.209999999999916 | 0.213 | 0.053 | 0.023 |
| 0.214999999999916 | 0.218 | 0.054 | 0.024 |
| 0.219999999999916 | 0.224 | 0.055 | 0.024 |
| 0.224999999999916 | 0.229 | 0.056 | 0.025 |
| 0.229999999999916 | 0.234 | 0.058 | 0.026 |
| 0.234999999999916 | 0.239 | 0.059 | 0.026 |
| 0.239999999999916 | 0.245 | 0.06 | 0.027 |
| 0.244999999999916 | 0.25 | 0.062 | 0.027 |
| 0.249999999999916 | 0.255 | 0.063 | 0.028 |
| 0.254999999999916 | 0.261 | 0.064 | 0.028 |
| 0.259999999999916 | 0.266 | 0.065 | 0.029 |
| 0.264999999999916 | 0.271 | 0.067 | 0.03 |
| 0.269999999999916 | 0.277 | 0.068 | 0.03 |
| 0.274999999999916 | 0.282 | 0.069 | 0.031 |
| 0.279999999999916 | 0.288 | 0.07 | 0.031 |
| 0.284999999999916 | 0.293 | 0.072 | 0.032 |
| 0.289999999999916 | 0.299 | 0.073 | 0.032 |
| 0.294999999999916 | 0.304 | 0.074 | 0.033 |
| 0.299999999999916 | 0.31 | 0.076 | 0.033 |
| 0.304999999999916 | 0.315 | 0.077 | 0.034 |
| 0.309999999999916 | 0.321 | 0.078 | 0.035 |
| 0.314999999999916 | 0.326 | 0.079 | 0.035 |
| 0.319999999999916 | 0.332 | 0.081 | 0.036 |
| 0.324999999999916 | 0.337 | 0.082 | 0.036 |
| 0.329999999999916 | 0.343 | 0.083 | 0.037 |
| 0.334999999999916 | 0.348 | 0.085 | 0.037 |
| 0.339999999999916 | 0.354 | 0.086 | 0.038 |
| 0.344999999999916 | 0.36 | 0.087 | 0.039 |
| 0.349999999999916 | 0.365 | 0.088 | 0.039 |
| 0.354999999999916 | 0.371 | 0.09 | 0.04 |
| 0.359999999999916 | 0.377 | 0.091 | 0.04 |
| 0.364999999999916 | 0.383 | 0.092 | 0.041 |
| 0.369999999999916 | 0.388 | 0.094 | 0.041 |
| 0.374999999999916 | 0.394 | 0.095 | 0.042 |
| 0.379999999999916 | 0.4 | 0.096 | 0.042 |
| 0.384999999999916 | 0.406 | 0.097 | 0.043 |
| 0.389999999999916 | 0.412 | 0.099 | 0.044 |
| 0.394999999999916 | 0.418 | 0.1 | 0.044 |
| 0.399999999999916 | 0.424 | 0.101 | 0.045 |
| 0.404999999999916 | 0.43 | 0.103 | 0.045 |
| 0.409999999999916 | 0.436 | 0.104 | 0.046 |
| 0.414999999999916 | 0.442 | 0.105 | 0.046 |
| 0.419999999999916 | 0.448 | 0.107 | 0.047 |
| 0.424999999999916 | 0.454 | 0.108 | 0.048 |
| 0.429999999999916 | 0.46 | 0.109 | 0.048 |
| 0.434999999999916 | 0.466 | 0.111 | 0.049 |
| 0.439999999999916 | 0.472 | 0.112 | 0.049 |
| 0.444999999999916 | 0.478 | 0.113 | 0.05 |
| 0.449999999999916 | 0.485 | 0.114 | 0.05 |
| 0.454999999999916 | 0.491 | 0.116 | 0.051 |
| 0.459999999999916 | 0.497 | 0.117 | 0.052 |
| 0.464999999999916 | 0.504 | 0.118 | 0.052 |
| 0.469999999999916 | 0.51 | 0.12 | 0.053 |
| 0.474999999999916 | 0.517 | 0.121 | 0.053 |
| 0.479999999999916 | 0.523 | 0.122 | 0.054 |
| 0.484999999999916 | 0.53 | 0.124 | 0.054 |
| 0.489999999999916 | 0.536 | 0.125 | 0.055 |
| 0.494999999999916 | 0.543 | 0.126 | 0.056 |
| 0.499999999999916 | 0.549 | 0.128 | 0.056 |
| 0.504999999999916 | 0.556 | 0.129 | 0.057 |
| 0.509999999999916 | 0.563 | 0.13 | 0.057 |
| 0.514999999999916 | 0.57 | 0.132 | 0.058 |
| 0.519999999999916 | 0.576 | 0.133 | 0.058 |
| 0.524999999999916 | 0.583 | 0.134 | 0.059 |
| 0.529999999999916 | 0.59 | 0.136 | 0.06 |
| 0.534999999999916 | 0.597 | 0.137 | 0.06 |
| 0.539999999999916 | 0.604 | 0.138 | 0.061 |
| 0.544999999999916 | 0.611 | 0.14 | 0.061 |
| 0.549999999999916 | 0.618 | 0.141 | 0.062 |
| 0.554999999999916 | 0.626 | 0.142 | 0.062 |
| 0.559999999999916 | 0.633 | 0.144 | 0.063 |
| 0.564999999999916 | 0.64 | 0.145 | 0.064 |
| 0.569999999999916 | 0.648 | 0.147 | 0.064 |
| 0.574999999999916 | 0.655 | 0.148 | 0.065 |
| 0.579999999999916 | 0.662 | 0.149 | 0.065 |
| 0.584999999999916 | 0.67 | 0.151 | 0.066 |
| 0.589999999999916 | 0.678 | 0.152 | 0.066 |
| 0.594999999999916 | 0.685 | 0.153 | 0.067 |
| 0.599999999999916 | 0.693 | 0.155 | 0.068 |
| 0.604999999999916 | 0.701 | 0.156 | 0.068 |
| 0.609999999999916 | 0.709 | 0.158 | 0.069 |
| 0.614999999999916 | 0.717 | 0.159 | 0.069 |
| 0.619999999999916 | 0.725 | 0.16 | 0.07 |
| 0.624999999999916 | 0.733 | 0.162 | 0.07 |
| 0.629999999999916 | 0.741 | 0.163 | 0.071 |
| 0.634999999999916 | 0.75 | 0.164 | 0.072 |
| 0.639999999999916 | 0.758 | 0.166 | 0.072 |
| 0.644999999999916 | 0.767 | 0.167 | 0.073 |
| 0.649999999999916 | 0.775 | 0.169 | 0.073 |
| 0.654999999999916 | 0.784 | 0.17 | 0.074 |
| 0.659999999999916 | 0.793 | 0.171 | 0.075 |
| 0.664999999999916 | 0.802 | 0.173 | 0.075 |
| 0.669999999999916 | 0.811 | 0.174 | 0.076 |
| 0.674999999999916 | 0.82 | 0.176 | 0.076 |
| 0.679999999999916 | 0.829 | 0.177 | 0.077 |
| 0.684999999999916 | 0.838 | 0.178 | 0.077 |
| 0.689999999999916 | 0.848 | 0.18 | 0.078 |
| 0.694999999999916 | 0.858 | 0.181 | 0.079 |
| 0.699999999999916 | 0.867 | 0.183 | 0.079 |
| 0.704999999999916 | 0.877 | 0.184 | 0.08 |
| 0.709999999999916 | 0.887 | 0.186 | 0.08 |
| 0.714999999999916 | 0.897 | 0.187 | 0.081 |
| 0.719999999999916 | 0.908 | 0.188 | 0.082 |
| 0.724999999999916 | 0.918 | 0.19 | 0.082 |
| 0.729999999999916 | 0.929 | 0.191 | 0.083 |
| 0.734999999999916 | 0.94 | 0.193 | 0.083 |
| 0.739999999999916 | 0.95 | 0.194 | 0.084 |
| 0.744999999999916 | 0.962 | 0.196 | 0.085 |
| 0.749999999999916 | 0.973 | 0.197 | 0.085 |
| 0.754999999999916 | 0.984 | 0.199 | 0.086 |
| 0.759999999999916 | 0.996 | 0.2 | 0.086 |
| 0.764999999999916 | 1.008 | 0.201 | 0.087 |
| 0.769999999999916 | 1.02 | 0.203 | 0.088 |
| 0.774999999999916 | 1.033 | 0.204 | 0.088 |
| 0.779999999999916 | 1.045 | 0.206 | 0.089 |
| 0.784999999999916 | 1.058 | 0.207 | 0.089 |
| 0.789999999999916 | 1.071 | 0.209 | 0.09 |
| 0.794999999999916 | 1.085 | 0.21 | 0.09 |
| 0.799999999999916 | 1.099 | 0.212 | 0.091 |
| 0.804999999999916 | 1.113 | 0.213 | 0.092 |
| 0.809999999999916 | 1.127 | 0.215 | 0.092 |
| 0.814999999999916 | 1.142 | 0.216 | 0.093 |
| 0.819999999999916 | 1.157 | 0.218 | 0.093 |
| 0.824999999999916 | 1.172 | 0.219 | 0.094 |
| 0.829999999999916 | 1.188 | 0.221 | 0.095 |
| 0.834999999999916 | 1.204 | 0.222 | 0.095 |
| 0.839999999999916 | 1.221 | 0.224 | 0.096 |
| 0.844999999999916 | 1.238 | 0.225 | 0.096 |
| 0.849999999999916 | 1.256 | 0.227 | 0.097 |
| 0.854999999999916 | 1.274 | 0.228 | 0.098 |
| 0.859999999999916 | 1.293 | 0.23 | 0.098 |
| 0.864999999999916 | 1.313 | 0.231 | 0.099 |
| 0.869999999999916 | 1.333 | 0.233 | 0.1 |
| 0.874999999999916 | 1.354 | 0.235 | 0.1 |
| 0.879999999999916 | 1.376 | 0.236 | 0.101 |
| 0.884999999999916 | 1.398 | 0.238 | 0.101 |
| 0.889999999999916 | 1.422 | 0.239 | 0.102 |
| 0.894999999999916 | 1.447 | 0.241 | 0.103 |
| 0.899999999999916 | 1.472 | 0.242 | 0.103 |
| 0.904999999999916 | 1.499 | 0.244 | 0.104 |
| 0.909999999999916 | 1.528 | 0.245 | 0.104 |
| 0.914999999999916 | 1.557 | 0.247 | 0.105 |
| 0.919999999999916 | 1.589 | 0.249 | 0.106 |
| 0.924999999999916 | 1.623 | 0.25 | 0.106 |
| 0.929999999999916 | 1.658 | 0.252 | 0.107 |
| 0.934999999999916 | 1.697 | 0.253 | 0.107 |
| 0.939999999999916 | 1.738 | 0.255 | 0.108 |
| 0.944999999999916 | 1.783 | 0.257 | 0.109 |
| 0.949999999999916 | 1.832 | 0.258 | 0.109 |
| 0.954999999999916 | 1.886 | 0.26 | 0.11 |
| 0.959999999999916 | 1.946 | 0.261 | 0.111 |
| 0.964999999999916 | 2.014 | 0.263 | 0.111 |
| 0.969999999999916 | 2.092 | 0.265 | 0.112 |
| 0.974999999999916 | 2.185 | 0.266 | 0.112 |
| 0.979999999999916 | 2.298 | 0.268 | 0.113 |
| 0.984999999999916 | 2.443 | 0.27 | 0.114 |
| 0.989999999999916 | 2.647 | 0.271 | 0.114 |
| 0.994999999999916 | 2.994 | 0.273 | 0.115 |
| 0.999999999999916 | 15.402 | 0.275 | 0.116 |
| 1.004999999999916 | 2.997 | 0.276 | 0.116 |
| 1.009999999999916 | 2.652 | 0.278 | 0.117 |
| 1.014999999999916 | 2.45 | 0.28 | 0.117 |
| 1.019999999999916 | 2.308 | 0.281 | 0.118 |
| 1.024999999999916 | 2.197 | 0.283 | 0.119 |
| 1.029999999999916 | 2.107 | 0.285 | 0.119 |
| 1.034999999999916 | 2.031 | 0.286 | 0.12 |
| 1.039999999999915 | 1.966 | 0.288 | 0.121 |
| 1.044999999999915 | 1.908 | 0.29 | 0.121 |
| 1.049999999999915 | 1.857 | 0.292 | 0.122 |
| 1.054999999999915 | 1.81 | 0.293 | 0.122 |
| 1.059999999999915 | 1.768 | 0.295 | 0.123 |
| 1.064999999999915 | 1.729 | 0.297 | 0.124 |
| 1.069999999999915 | 1.693 | 0.299 | 0.124 |
| 1.074999999999915 | 1.66 | 0.3 | 0.125 |
| 1.079999999999915 | 1.629 | 0.302 | 0.126 |
| 1.084999999999914 | 1.6 | 0.304 | 0.126 |
| 1.089999999999914 | 1.573 | 0.306 | 0.127 |
| 1.094999999999914 | 1.547 | 0.307 | 0.128 |
| 1.099999999999914 | 1.522 | 0.309 | 0.128 |
| 1.104999999999914 | 1.499 | 0.311 | 0.129 |
| 1.109999999999914 | 1.477 | 0.313 | 0.129 |
| 1.114999999999914 | 1.456 | 0.315 | 0.13 |
| 1.119999999999914 | 1.436 | 0.316 | 0.131 |
| 1.124999999999914 | 1.417 | 0.318 | 0.131 |
| 1.129999999999914 | 1.398 | 0.32 | 0.132 |
| 1.134999999999913 | 1.38 | 0.322 | 0.133 |
| 1.139999999999913 | 1.363 | 0.324 | 0.133 |
| 1.144999999999913 | 1.347 | 0.326 | 0.134 |
| 1.149999999999913 | 1.331 | 0.327 | 0.135 |
| 1.154999999999913 | 1.316 | 0.329 | 0.135 |
| 1.159999999999913 | 1.301 | 0.331 | 0.136 |
| 1.164999999999913 | 1.287 | 0.333 | 0.137 |
| 1.169999999999913 | 1.273 | 0.335 | 0.137 |
| 1.174999999999913 | 1.26 | 0.337 | 0.138 |
| 1.179999999999912 | 1.247 | 0.339 | 0.139 |
| 1.184999999999912 | 1.235 | 0.341 | 0.139 |
| 1.189999999999912 | 1.222 | 0.343 | 0.14 |
| 1.194999999999912 | 1.21 | 0.345 | 0.141 |
| 1.199999999999912 | 1.199 | 0.347 | 0.141 |
| 1.204999999999912 | 1.188 | 0.349 | 0.142 |
| 1.209999999999912 | 1.177 | 0.35 | 0.143 |
| 1.214999999999912 | 1.166 | 0.352 | 0.143 |
| 1.219999999999912 | 1.156 | 0.354 | 0.144 |
| 1.224999999999911 | 1.146 | 0.356 | 0.145 |
| 1.229999999999911 | 1.136 | 0.358 | 0.145 |
| 1.234999999999911 | 1.126 | 0.36 | 0.146 |
| 1.239999999999911 | 1.117 | 0.363 | 0.147 |
| 1.244999999999911 | 1.108 | 0.365 | 0.147 |
| 1.249999999999911 | 1.099 | 0.367 | 0.148 |
| 1.254999999999911 | 1.09 | 0.369 | 0.149 |
| 1.259999999999911 | 1.081 | 0.371 | 0.149 |
| 1.264999999999911 | 1.073 | 0.373 | 0.15 |
| 1.269999999999911 | 1.065 | 0.375 | 0.151 |
| 1.27499999999991 | 1.056 | 0.377 | 0.151 |
| 1.27999999999991 | 1.049 | 0.379 | 0.152 |
| 1.28499999999991 | 1.041 | 0.381 | 0.153 |
| 1.28999999999991 | 1.033 | 0.383 | 0.153 |
| 1.29499999999991 | 1.026 | 0.385 | 0.154 |
| 1.29999999999991 | 1.018 | 0.388 | 0.155 |
| 1.30499999999991 | 1.011 | 0.39 | 0.155 |
| 1.30999999999991 | 1.004 | 0.392 | 0.156 |
| 1.31499999999991 | 0.997 | 0.394 | 0.157 |
| 1.319999999999909 | 0.991 | 0.396 | 0.157 |
| 1.324999999999909 | 0.984 | 0.399 | 0.158 |
| 1.329999999999909 | 0.977 | 0.401 | 0.159 |
| 1.334999999999909 | 0.971 | 0.403 | 0.159 |
| 1.339999999999909 | 0.964 | 0.405 | 0.16 |
| 1.344999999999909 | 0.958 | 0.408 | 0.161 |
| 1.349999999999909 | 0.952 | 0.41 | 0.162 |
| 1.354999999999909 | 0.946 | 0.412 | 0.162 |
| 1.359999999999909 | 0.94 | 0.415 | 0.163 |
| 1.364999999999908 | 0.934 | 0.417 | 0.164 |
| 1.369999999999908 | 0.929 | 0.419 | 0.164 |
| 1.374999999999908 | 0.923 | 0.422 | 0.165 |
| 1.379999999999908 | 0.917 | 0.424 | 0.166 |
| 1.384999999999908 | 0.912 | 0.426 | 0.166 |
| 1.389999999999908 | 0.906 | 0.429 | 0.167 |
| 1.394999999999908 | 0.901 | 0.431 | 0.168 |
| 1.399999999999908 | 0.896 | 0.434 | 0.169 |
| 1.404999999999908 | 0.891 | 0.436 | 0.169 |
| 1.409999999999908 | 0.886 | 0.439 | 0.17 |
| 1.414999999999907 | 0.881 | 0.441 | 0.171 |
| 1.419999999999907 | 0.876 | 0.444 | 0.171 |
| 1.424999999999907 | 0.871 | 0.446 | 0.172 |
| 1.429999999999907 | 0.866 | 0.449 | 0.173 |
| 1.434999999999907 | 0.861 | 0.451 | 0.174 |
| 1.439999999999907 | 0.856 | 0.454 | 0.174 |
| 1.444999999999907 | 0.852 | 0.456 | 0.175 |
| 1.449999999999907 | 0.847 | 0.459 | 0.176 |
| 1.454999999999907 | 0.843 | 0.462 | 0.177 |
| 1.459999999999906 | 0.838 | 0.464 | 0.177 |
| 1.464999999999906 | 0.834 | 0.467 | 0.178 |
| 1.469999999999906 | 0.83 | 0.47 | 0.179 |
| 1.474999999999906 | 0.825 | 0.472 | 0.179 |
| 1.479999999999906 | 0.821 | 0.475 | 0.18 |
| 1.484999999999906 | 0.817 | 0.478 | 0.181 |
| 1.489999999999906 | 0.813 | 0.481 | 0.182 |
| 1.494999999999906 | 0.809 | 0.484 | 0.182 |
| 1.499999999999906 | 0.805 | 0.486 | 0.183 |
| 1.504999999999906 | 0.801 | 0.489 | 0.184 |
| 1.509999999999905 | 0.797 | 0.492 | 0.185 |
| 1.514999999999905 | 0.793 | 0.495 | 0.185 |
| 1.519999999999905 | 0.789 | 0.498 | 0.186 |
| 1.524999999999905 | 0.785 | 0.501 | 0.187 |
| 1.529999999999905 | 0.782 | 0.504 | 0.188 |
| 1.534999999999905 | 0.778 | 0.507 | 0.188 |
| 1.539999999999905 | 0.774 | 0.51 | 0.189 |
| 1.544999999999905 | 0.771 | 0.513 | 0.19 |
| 1.549999999999905 | 0.767 | 0.516 | 0.191 |
| 1.554999999999904 | 0.763 | 0.52 | 0.191 |
| 1.559999999999904 | 0.76 | 0.523 | 0.192 |
| 1.564999999999904 | 0.756 | 0.526 | 0.193 |
| 1.569999999999904 | 0.753 | 0.529 | 0.194 |
| 1.574999999999904 | 0.75 | 0.532 | 0.194 |
| 1.579999999999904 | 0.746 | 0.536 | 0.195 |
| 1.584999999999904 | 0.743 | 0.539 | 0.196 |
| 1.589999999999904 | 0.74 | 0.542 | 0.197 |
| 1.594999999999904 | 0.736 | 0.546 | 0.197 |
| 1.599999999999903 | 0.733 | 0.549 | 0.198 |
| 1.604999999999903 | 0.73 | 0.553 | 0.199 |
| 1.609999999999903 | 0.727 | 0.556 | 0.2 |
| 1.614999999999903 | 0.724 | 0.56 | 0.201 |
| 1.619999999999903 | 0.721 | 0.564 | 0.201 |
| 1.624999999999903 | 0.718 | 0.567 | 0.202 |
| 1.629999999999903 | 0.715 | 0.571 | 0.203 |
| 1.634999999999903 | 0.712 | 0.575 | 0.204 |
| 1.639999999999903 | 0.709 | 0.578 | 0.205 |
| 1.644999999999902 | 0.706 | 0.582 | 0.205 |
| 1.649999999999902 | 0.703 | 0.586 | 0.206 |
| 1.654999999999902 | 0.7 | 0.59 | 0.207 |
| 1.659999999999902 | 0.697 | 0.594 | 0.208 |
| 1.664999999999902 | 0.694 | 0.598 | 0.209 |
| 1.669999999999902 | 0.691 | 0.602 | 0.209 |
| 1.674999999999902 | 0.688 | 0.606 | 0.21 |
| 1.679999999999902 | 0.686 | 0.611 | 0.211 |
| 1.684999999999902 | 0.683 | 0.615 | 0.212 |
| 1.689999999999901 | 0.68 | 0.619 | 0.213 |
| 1.694999999999901 | 0.678 | 0.624 | 0.213 |
| 1.699999999999901 | 0.675 | 0.628 | 0.214 |
| 1.704999999999901 | 0.672 | 0.633 | 0.215 |
| 1.709999999999901 | 0.67 | 0.637 | 0.216 |
| 1.714999999999901 | 0.667 | 0.642 | 0.217 |
| 1.719999999999901 | 0.665 | 0.647 | 0.217 |
| 1.724999999999901 | 0.662 | 0.652 | 0.218 |
| 1.729999999999901 | 0.66 | 0.656 | 0.219 |
| 1.734999999999901 | 0.657 | 0.661 | 0.22 |
| 1.7399999999999 | 0.655 | 0.667 | 0.221 |
| 1.7449999999999 | 0.652 | 0.672 | 0.222 |
| 1.7499999999999 | 0.65 | 0.677 | 0.223 |
| 1.7549999999999 | 0.647 | 0.682 | 0.223 |
| 1.7599999999999 | 0.645 | 0.688 | 0.224 |
| 1.7649999999999 | 0.642 | 0.693 | 0.225 |
| 1.7699999999999 | 0.64 | 0.699 | 0.226 |
| 1.7749999999999 | 0.638 | 0.705 | 0.227 |
| 1.7799999999999 | 0.635 | 0.711 | 0.228 |
| 1.784999999999899 | 0.633 | 0.717 | 0.228 |
| 1.789999999999899 | 0.631 | 0.723 | 0.229 |
| 1.794999999999899 | 0.629 | 0.73 | 0.23 |
| 1.799999999999899 | 0.626 | 0.736 | 0.231 |
| 1.804999999999899 | 0.624 | 0.743 | 0.232 |
| 1.809999999999899 | 0.622 | 0.75 | 0.233 |
| 1.814999999999899 | 0.62 | 0.757 | 0.234 |
| 1.819999999999899 | 0.618 | 0.764 | 0.235 |
| 1.824999999999899 | 0.615 | 0.771 | 0.235 |
| 1.829999999999899 | 0.613 | 0.779 | 0.236 |
| 1.834999999999898 | 0.611 | 0.786 | 0.237 |
| 1.839999999999898 | 0.609 | 0.795 | 0.238 |
| 1.844999999999898 | 0.607 | 0.803 | 0.239 |
| 1.849999999999898 | 0.605 | 0.811 | 0.24 |
| 1.854999999999898 | 0.603 | 0.82 | 0.241 |
| 1.859999999999898 | 0.601 | 0.829 | 0.242 |
| 1.864999999999898 | 0.599 | 0.839 | 0.243 |
| 1.869999999999898 | 0.597 | 0.848 | 0.243 |
| 1.874999999999898 | 0.595 | 0.858 | 0.244 |
| 1.879999999999897 | 0.593 | 0.869 | 0.245 |
| 1.884999999999897 | 0.591 | 0.88 | 0.246 |
| 1.889999999999897 | 0.589 | 0.891 | 0.247 |
| 1.894999999999897 | 0.587 | 0.903 | 0.248 |
| 1.899999999999897 | 0.585 | 0.916 | 0.249 |
| 1.904999999999897 | 0.583 | 0.929 | 0.25 |
| 1.909999999999897 | 0.581 | 0.943 | 0.251 |
| 1.914999999999897 | 0.579 | 0.957 | 0.252 |
| 1.919999999999897 | 0.577 | 0.973 | 0.253 |
| 1.924999999999897 | 0.576 | 0.989 | 0.254 |
| 1.929999999999896 | 0.574 | 1.007 | 0.255 |
| 1.934999999999896 | 0.572 | 1.026 | 0.256 |
| 1.939999999999896 | 0.57 | 1.046 | 0.257 |
| 1.944999999999896 | 0.568 | 1.068 | 0.257 |
| 1.949999999999896 | 0.567 | 1.092 | 0.258 |
| 1.954999999999896 | 0.565 | 1.119 | 0.259 |
| 1.959999999999896 | 0.563 | 1.149 | 0.26 |
| 1.964999999999896 | 0.561 | 1.182 | 0.261 |
| 1.969999999999896 | 0.56 | 1.221 | 0.262 |
| 1.974999999999895 | 0.558 | 1.267 | 0.263 |
| 1.979999999999895 | 0.556 | 1.323 | 0.264 |
| 1.984999999999895 | 0.554 | 1.396 | 0.265 |
| 1.989999999999895 | 0.553 | 1.497 | 0.266 |
| 1.994999999999895 | 0.551 | 1.671 | 0.267 |
| 1.999999999999895 | 0.549 | 7.818 | 0.268 |
| 2.004999999999895 | 0.548 | 1.671 | 0.269 |
| 2.009999999999895 | 0.546 | 1.498 | 0.27 |
| 2.014999999999895 | 0.544 | 1.397 | 0.271 |
| 2.019999999999895 | 0.543 | 1.326 | 0.272 |
| 2.024999999999895 | 0.541 | 1.27 | 0.273 |
| 2.029999999999895 | 0.54 | 1.225 | 0.274 |
| 2.034999999999894 | 0.538 | 1.187 | 0.275 |
| 2.039999999999894 | 0.536 | 1.154 | 0.276 |
| 2.044999999999894 | 0.535 | 1.125 | 0.277 |
| 2.049999999999894 | 0.533 | 1.099 | 0.278 |
| 2.054999999999894 | 0.532 | 1.075 | 0.279 |
| 2.059999999999894 | 0.53 | 1.054 | 0.281 |
| 2.064999999999894 | 0.529 | 1.034 | 0.282 |
| 2.069999999999894 | 0.527 | 1.016 | 0.283 |
| 2.074999999999894 | 0.525 | 0.999 | 0.284 |
| 2.079999999999893 | 0.524 | 0.983 | 0.285 |
| 2.084999999999893 | 0.522 | 0.968 | 0.286 |
| 2.089999999999893 | 0.521 | 0.954 | 0.287 |
| 2.094999999999893 | 0.52 | 0.941 | 0.288 |
| 2.099999999999893 | 0.518 | 0.928 | 0.289 |
| 2.104999999999893 | 0.517 | 0.917 | 0.29 |
| 2.109999999999893 | 0.515 | 0.905 | 0.291 |
| 2.114999999999893 | 0.514 | 0.894 | 0.292 |
| 2.119999999999893 | 0.512 | 0.884 | 0.293 |
| 2.124999999999893 | 0.511 | 0.874 | 0.295 |
| 2.129999999999892 | 0.509 | 0.865 | 0.296 |
| 2.134999999999892 | 0.508 | 0.855 | 0.297 |
| 2.139999999999892 | 0.507 | 0.847 | 0.298 |
| 2.144999999999892 | 0.505 | 0.838 | 0.299 |
| 2.149999999999892 | 0.504 | 0.83 | 0.3 |
| 2.154999999999892 | 0.502 | 0.822 | 0.301 |
| 2.159999999999892 | 0.501 | 0.815 | 0.303 |
| 2.164999999999892 | 0.5 | 0.807 | 0.304 |
| 2.169999999999892 | 0.498 | 0.8 | 0.305 |
| 2.174999999999891 | 0.497 | 0.793 | 0.306 |
| 2.179999999999891 | 0.496 | 0.786 | 0.307 |
| 2.184999999999891 | 0.494 | 0.78 | 0.308 |
| 2.189999999999891 | 0.493 | 0.773 | 0.31 |
| 2.194999999999891 | 0.492 | 0.767 | 0.311 |
| 2.199999999999891 | 0.49 | 0.761 | 0.312 |
| 2.204999999999891 | 0.489 | 0.755 | 0.313 |
| 2.209999999999891 | 0.488 | 0.75 | 0.314 |
| 2.214999999999891 | 0.487 | 0.744 | 0.316 |
| 2.21999999999989 | 0.485 | 0.738 | 0.317 |
| 2.22499999999989 | 0.484 | 0.733 | 0.318 |
| 2.22999999999989 | 0.483 | 0.728 | 0.319 |
| 2.23499999999989 | 0.481 | 0.723 | 0.321 |
| 2.23999999999989 | 0.48 | 0.718 | 0.322 |
| 2.24499999999989 | 0.479 | 0.713 | 0.323 |
| 2.24999999999989 | 0.478 | 0.708 | 0.324 |
| 2.25499999999989 | 0.477 | 0.704 | 0.326 |
| 2.25999999999989 | 0.475 | 0.699 | 0.327 |
| 2.26499999999989 | 0.474 | 0.695 | 0.328 |
| 2.269999999999889 | 0.473 | 0.69 | 0.329 |
| 2.274999999999889 | 0.472 | 0.686 | 0.331 |
| 2.279999999999889 | 0.47 | 0.682 | 0.332 |
| 2.284999999999889 | 0.469 | 0.678 | 0.333 |
| 2.289999999999889 | 0.468 | 0.674 | 0.335 |
| 2.294999999999889 | 0.467 | 0.67 | 0.336 |
| 2.299999999999889 | 0.466 | 0.666 | 0.337 |
| 2.304999999999889 | 0.465 | 0.662 | 0.339 |
| 2.309999999999889 | 0.463 | 0.658 | 0.34 |
| 2.314999999999888 | 0.462 | 0.654 | 0.341 |
| 2.319999999999888 | 0.461 | 0.651 | 0.343 |
| 2.324999999999888 | 0.46 | 0.647 | 0.344 |
| 2.329999999999888 | 0.459 | 0.644 | 0.346 |
| 2.334999999999888 | 0.458 | 0.64 | 0.347 |
| 2.339999999999888 | 0.457 | 0.637 | 0.348 |
| 2.344999999999888 | 0.456 | 0.633 | 0.35 |
| 2.349999999999888 | 0.454 | 0.63 | 0.351 |
| 2.354999999999888 | 0.453 | 0.627 | 0.353 |
| 2.359999999999887 | 0.452 | 0.624 | 0.354 |
| 2.364999999999887 | 0.451 | 0.62 | 0.356 |
| 2.369999999999887 | 0.45 | 0.617 | 0.357 |
| 2.374999999999887 | 0.449 | 0.614 | 0.359 |
| 2.379999999999887 | 0.448 | 0.611 | 0.36 |
| 2.384999999999887 | 0.447 | 0.608 | 0.362 |
| 2.389999999999887 | 0.446 | 0.605 | 0.363 |
| 2.394999999999887 | 0.445 | 0.602 | 0.365 |
| 2.399999999999887 | 0.444 | 0.599 | 0.366 |
| 2.404999999999887 | 0.443 | 0.597 | 0.368 |
| 2.409999999999886 | 0.442 | 0.594 | 0.369 |
| 2.414999999999886 | 0.441 | 0.591 | 0.371 |
| 2.419999999999886 | 0.439 | 0.588 | 0.372 |
| 2.424999999999886 | 0.438 | 0.586 | 0.374 |
| 2.429999999999886 | 0.437 | 0.583 | 0.376 |
| 2.434999999999886 | 0.436 | 0.58 | 0.377 |
| 2.439999999999886 | 0.435 | 0.578 | 0.379 |
| 2.444999999999886 | 0.434 | 0.575 | 0.381 |
| 2.449999999999886 | 0.433 | 0.573 | 0.382 |
| 2.454999999999885 | 0.432 | 0.57 | 0.384 |
| 2.459999999999885 | 0.431 | 0.568 | 0.386 |
| 2.464999999999885 | 0.43 | 0.565 | 0.387 |
| 2.469999999999885 | 0.429 | 0.563 | 0.389 |
| 2.474999999999885 | 0.428 | 0.561 | 0.391 |
| 2.479999999999885 | 0.427 | 0.558 | 0.393 |
| 2.484999999999885 | 0.427 | 0.556 | 0.394 |
| 2.489999999999885 | 0.426 | 0.554 | 0.396 |
| 2.494999999999885 | 0.425 | 0.552 | 0.398 |
| 2.499999999999884 | 0.424 | 0.549 | 0.4 |
| 2.504999999999884 | 0.423 | 0.547 | 0.401 |
| 2.509999999999884 | 0.422 | 0.545 | 0.403 |
| 2.514999999999884 | 0.421 | 0.543 | 0.405 |
| 2.519999999999884 | 0.42 | 0.541 | 0.407 |
| 2.524999999999884 | 0.419 | 0.538 | 0.409 |
| 2.529999999999884 | 0.418 | 0.536 | 0.411 |
| 2.534999999999884 | 0.417 | 0.534 | 0.413 |
| 2.539999999999884 | 0.416 | 0.532 | 0.415 |
| 2.544999999999884 | 0.415 | 0.53 | 0.417 |
| 2.549999999999883 | 0.414 | 0.528 | 0.419 |
| 2.554999999999883 | 0.413 | 0.526 | 0.421 |
| 2.559999999999883 | 0.413 | 0.524 | 0.423 |
| 2.564999999999883 | 0.412 | 0.522 | 0.425 |
| 2.569999999999883 | 0.411 | 0.52 | 0.427 |
| 2.574999999999883 | 0.41 | 0.518 | 0.429 |
| 2.579999999999883 | 0.409 | 0.517 | 0.431 |
| 2.584999999999883 | 0.408 | 0.515 | 0.433 |
| 2.589999999999883 | 0.407 | 0.513 | 0.435 |
| 2.594999999999882 | 0.406 | 0.511 | 0.438 |
| 2.599999999999882 | 0.405 | 0.509 | 0.44 |
| 2.604999999999882 | 0.405 | 0.507 | 0.442 |
| 2.609999999999882 | 0.404 | 0.506 | 0.444 |
| 2.614999999999882 | 0.403 | 0.504 | 0.447 |
| 2.619999999999882 | 0.402 | 0.502 | 0.449 |
| 2.624999999999882 | 0.401 | 0.5 | 0.451 |
| 2.629999999999882 | 0.4 | 0.499 | 0.454 |
| 2.634999999999882 | 0.399 | 0.497 | 0.456 |
| 2.639999999999881 | 0.399 | 0.495 | 0.459 |
| 2.644999999999881 | 0.398 | 0.494 | 0.461 |
| 2.649999999999881 | 0.397 | 0.492 | 0.464 |
| 2.654999999999881 | 0.396 | 0.49 | 0.466 |
| 2.659999999999881 | 0.395 | 0.489 | 0.469 |
| 2.664999999999881 | 0.395 | 0.487 | 0.471 |
| 2.669999999999881 | 0.394 | 0.485 | 0.474 |
| 2.674999999999881 | 0.393 | 0.484 | 0.477 |
| 2.679999999999881 | 0.392 | 0.482 | 0.479 |
| 2.68499999999988 | 0.391 | 0.481 | 0.482 |
| 2.68999999999988 | 0.39 | 0.479 | 0.485 |
| 2.69499999999988 | 0.39 | 0.478 | 0.488 |
| 2.69999999999988 | 0.389 | 0.476 | 0.491 |
| 2.70499999999988 | 0.388 | 0.475 | 0.494 |
| 2.70999999999988 | 0.387 | 0.473 | 0.497 |
| 2.71499999999988 | 0.386 | 0.472 | 0.5 |
| 2.71999999999988 | 0.386 | 0.47 | 0.503 |
| 2.72499999999988 | 0.385 | 0.469 | 0.506 |
| 2.72999999999988 | 0.384 | 0.467 | 0.509 |
| 2.734999999999879 | 0.383 | 0.466 | 0.512 |
| 2.739999999999879 | 0.383 | 0.464 | 0.516 |
| 2.744999999999879 | 0.382 | 0.463 | 0.519 |
| 2.749999999999879 | 0.381 | 0.461 | 0.523 |
| 2.754999999999879 | 0.38 | 0.46 | 0.526 |
| 2.759999999999879 | 0.38 | 0.459 | 0.53 |
| 2.764999999999879 | 0.379 | 0.457 | 0.533 |
| 2.769999999999879 | 0.378 | 0.456 | 0.537 |
| 2.774999999999879 | 0.377 | 0.455 | 0.541 |
| 2.779999999999878 | 0.377 | 0.453 | 0.545 |
| 2.784999999999878 | 0.376 | 0.452 | 0.549 |
| 2.789999999999878 | 0.375 | 0.451 | 0.553 |
| 2.794999999999878 | 0.374 | 0.449 | 0.557 |
| 2.799999999999878 | 0.374 | 0.448 | 0.561 |
| 2.804999999999878 | 0.373 | 0.447 | 0.566 |
| 2.809999999999878 | 0.372 | 0.445 | 0.57 |
| 2.814999999999878 | 0.371 | 0.444 | 0.575 |
| 2.819999999999878 | 0.371 | 0.443 | 0.579 |
| 2.824999999999878 | 0.37 | 0.442 | 0.584 |
| 2.829999999999877 | 0.369 | 0.44 | 0.589 |
| 2.834999999999877 | 0.369 | 0.439 | 0.594 |
| 2.839999999999877 | 0.368 | 0.438 | 0.6 |
| 2.844999999999877 | 0.367 | 0.437 | 0.605 |
| 2.849999999999877 | 0.366 | 0.435 | 0.611 |
| 2.854999999999877 | 0.366 | 0.434 | 0.616 |
| 2.859999999999877 | 0.365 | 0.433 | 0.622 |
| 2.864999999999877 | 0.364 | 0.432 | 0.629 |
| 2.869999999999877 | 0.364 | 0.431 | 0.635 |
| 2.874999999999876 | 0.363 | 0.429 | 0.642 |
| 2.879999999999876 | 0.362 | 0.428 | 0.649 |
| 2.884999999999876 | 0.362 | 0.427 | 0.656 |
| 2.889999999999876 | 0.361 | 0.426 | 0.663 |
| 2.894999999999876 | 0.36 | 0.425 | 0.671 |
| 2.899999999999876 | 0.36 | 0.424 | 0.68 |
| 2.904999999999876 | 0.359 | 0.423 | 0.688 |
| 2.909999999999876 | 0.358 | 0.421 | 0.697 |
| 2.914999999999876 | 0.358 | 0.42 | 0.707 |
| 2.919999999999876 | 0.357 | 0.419 | 0.717 |
| 2.924999999999875 | 0.356 | 0.418 | 0.728 |
| 2.929999999999875 | 0.356 | 0.417 | 0.74 |
| 2.934999999999875 | 0.355 | 0.416 | 0.752 |
| 2.939999999999875 | 0.354 | 0.415 | 0.766 |
| 2.944999999999875 | 0.354 | 0.414 | 0.78 |
| 2.949999999999875 | 0.353 | 0.413 | 0.797 |
| 2.954999999999875 | 0.352 | 0.412 | 0.814 |
| 2.959999999999875 | 0.352 | 0.411 | 0.834 |
| 2.964999999999875 | 0.351 | 0.41 | 0.856 |
| 2.969999999999874 | 0.35 | 0.408 | 0.882 |
| 2.974999999999874 | 0.35 | 0.407 | 0.913 |
| 2.979999999999874 | 0.349 | 0.406 | 0.95 |
| 2.984999999999874 | 0.348 | 0.405 | 0.998 |
| 2.989999999999874 | 0.348 | 0.404 | 1.066 |
| 2.994999999999874 | 0.347 | 0.403 | 1.182 |
| 2.999999999999874 | 0.347 | 0.402 | 5.249 |
| 3.004999999999874 | 0.346 | 0.401 | 1.182 |
| 3.009999999999874 | 0.345 | 0.4 | 1.066 |
| 3.014999999999874 | 0.345 | 0.399 | 0.999 |
| 3.019999999999873 | 0.344 | 0.398 | 0.951 |
| 3.024999999999873 | 0.343 | 0.397 | 0.914 |
| 3.029999999999873 | 0.343 | 0.396 | 0.884 |
| 3.034999999999873 | 0.342 | 0.396 | 0.858 |
| 3.039999999999873 | 0.342 | 0.395 | 0.836 |
| 3.044999999999873 | 0.341 | 0.394 | 0.817 |
| 3.049999999999873 | 0.34 | 0.393 | 0.799 |
| 3.054999999999873 | 0.34 | 0.392 | 0.784 |
| 3.059999999999873 | 0.339 | 0.391 | 0.769 |
| 3.064999999999872 | 0.339 | 0.39 | 0.756 |
| 3.069999999999872 | 0.338 | 0.389 | 0.744 |
| 3.074999999999872 | 0.337 | 0.388 | 0.732 |
| 3.079999999999872 | 0.337 | 0.387 | 0.722 |
| 3.084999999999872 | 0.336 | 0.386 | 0.712 |
| 3.089999999999872 | 0.336 | 0.385 | 0.702 |
| 3.094999999999872 | 0.335 | 0.384 | 0.694 |
| 3.099999999999872 | 0.335 | 0.383 | 0.685 |
| 3.104999999999872 | 0.334 | 0.383 | 0.677 |
| 3.109999999999872 | 0.333 | 0.382 | 0.67 |
| 3.114999999999871 | 0.333 | 0.381 | 0.662 |
| 3.119999999999871 | 0.332 | 0.38 | 0.655 |
| 3.124999999999871 | 0.332 | 0.379 | 0.649 |
| 3.129999999999871 | 0.331 | 0.378 | 0.642 |
| 3.134999999999871 | 0.331 | 0.377 | 0.636 |
| 3.139999999999871 | 0.33 | 0.377 | 0.63 |
| 3.144999999999871 | 0.329 | 0.376 | 0.624 |
| 3.149999999999871 | 0.329 | 0.375 | 0.619 |
| 3.154999999999871 | 0.328 | 0.374 | 0.614 |
| 3.15999999999987 | 0.328 | 0.373 | 0.608 |
| 3.16499999999987 | 0.327 | 0.372 | 0.603 |
| 3.16999999999987 | 0.327 | 0.371 | 0.599 |
| 3.17499999999987 | 0.326 | 0.371 | 0.594 |
| 3.17999999999987 | 0.325 | 0.37 | 0.589 |
| 3.18499999999987 | 0.325 | 0.369 | 0.585 |
| 3.18999999999987 | 0.324 | 0.368 | 0.581 |
| 3.19499999999987 | 0.324 | 0.367 | 0.576 |
| 3.19999999999987 | 0.323 | 0.367 | 0.572 |
| 3.204999999999869 | 0.323 | 0.366 | 0.568 |
| 3.209999999999869 | 0.322 | 0.365 | 0.564 |
| 3.214999999999869 | 0.322 | 0.364 | 0.561 |
| 3.219999999999869 | 0.321 | 0.363 | 0.557 |
| 3.224999999999869 | 0.321 | 0.363 | 0.553 |
| 3.229999999999869 | 0.32 | 0.362 | 0.55 |
| 3.234999999999869 | 0.32 | 0.361 | 0.546 |
| 3.239999999999869 | 0.319 | 0.36 | 0.543 |
| 3.244999999999869 | 0.319 | 0.36 | 0.54 |
| 3.249999999999869 | 0.318 | 0.359 | 0.536 |
| 3.254999999999868 | 0.317 | 0.358 | 0.533 |
| 3.259999999999868 | 0.317 | 0.357 | 0.53 |
| 3.264999999999868 | 0.316 | 0.357 | 0.527 |
| 3.269999999999868 | 0.316 | 0.356 | 0.524 |
| 3.274999999999868 | 0.315 | 0.355 | 0.521 |
| 3.279999999999868 | 0.315 | 0.354 | 0.518 |
| 3.284999999999868 | 0.314 | 0.354 | 0.516 |
| 3.289999999999868 | 0.314 | 0.353 | 0.513 |
| 3.294999999999868 | 0.313 | 0.352 | 0.51 |
| 3.299999999999867 | 0.313 | 0.351 | 0.507 |
| 3.304999999999867 | 0.312 | 0.351 | 0.505 |
| 3.309999999999867 | 0.312 | 0.35 | 0.502 |
| 3.314999999999867 | 0.311 | 0.349 | 0.5 |
| 3.319999999999867 | 0.311 | 0.348 | 0.497 |
| 3.324999999999867 | 0.31 | 0.348 | 0.495 |
| 3.329999999999867 | 0.31 | 0.347 | 0.492 |
| 3.334999999999867 | 0.309 | 0.346 | 0.49 |
| 3.339999999999867 | 0.309 | 0.346 | 0.488 |
| 3.344999999999866 | 0.308 | 0.345 | 0.485 |
| 3.349999999999866 | 0.308 | 0.344 | 0.483 |
| 3.354999999999866 | 0.307 | 0.344 | 0.481 |
| 3.359999999999866 | 0.307 | 0.343 | 0.479 |
| 3.364999999999866 | 0.306 | 0.342 | 0.476 |
| 3.369999999999866 | 0.306 | 0.342 | 0.474 |
| 3.374999999999866 | 0.305 | 0.341 | 0.472 |
| 3.379999999999866 | 0.305 | 0.34 | 0.47 |
| 3.384999999999866 | 0.304 | 0.339 | 0.468 |
| 3.389999999999866 | 0.304 | 0.339 | 0.466 |
| 3.394999999999865 | 0.304 | 0.338 | 0.464 |
| 3.399999999999865 | 0.303 | 0.337 | 0.462 |
| 3.404999999999865 | 0.303 | 0.337 | 0.46 |
| 3.409999999999865 | 0.302 | 0.336 | 0.458 |
| 3.414999999999865 | 0.302 | 0.336 | 0.456 |
| 3.419999999999865 | 0.301 | 0.335 | 0.454 |
| 3.424999999999865 | 0.301 | 0.334 | 0.453 |
| 3.429999999999865 | 0.3 | 0.334 | 0.451 |
| 3.434999999999865 | 0.3 | 0.333 | 0.449 |
| 3.439999999999864 | 0.299 | 0.332 | 0.447 |
| 3.444999999999864 | 0.299 | 0.332 | 0.445 |
| 3.449999999999864 | 0.298 | 0.331 | 0.444 |
| 3.454999999999864 | 0.298 | 0.33 | 0.442 |
| 3.459999999999864 | 0.297 | 0.33 | 0.44 |
| 3.464999999999864 | 0.297 | 0.329 | 0.439 |
| 3.469999999999864 | 0.297 | 0.329 | 0.437 |
| 3.474999999999864 | 0.296 | 0.328 | 0.435 |
| 3.479999999999864 | 0.296 | 0.327 | 0.434 |
| 3.484999999999864 | 0.295 | 0.327 | 0.432 |
| 3.489999999999863 | 0.295 | 0.326 | 0.431 |
| 3.494999999999863 | 0.294 | 0.325 | 0.429 |
| 3.499999999999863 | 0.294 | 0.325 | 0.427 |
| 3.504999999999863 | 0.293 | 0.324 | 0.426 |
| 3.509999999999863 | 0.293 | 0.324 | 0.424 |
| 3.514999999999863 | 0.293 | 0.323 | 0.423 |
| 3.519999999999863 | 0.292 | 0.322 | 0.421 |
| 3.524999999999863 | 0.292 | 0.322 | 0.42 |
| 3.529999999999863 | 0.291 | 0.321 | 0.419 |
| 3.534999999999862 | 0.291 | 0.321 | 0.417 |
| 3.539999999999862 | 0.29 | 0.32 | 0.416 |
| 3.544999999999862 | 0.29 | 0.319 | 0.414 |
| 3.549999999999862 | 0.29 | 0.319 | 0.413 |
| 3.554999999999862 | 0.289 | 0.318 | 0.412 |
| 3.559999999999862 | 0.289 | 0.318 | 0.41 |
| 3.564999999999862 | 0.288 | 0.317 | 0.409 |
| 3.569999999999862 | 0.288 | 0.317 | 0.407 |
| 3.574999999999862 | 0.287 | 0.316 | 0.406 |
| 3.579999999999862 | 0.287 | 0.315 | 0.405 |
| 3.584999999999861 | 0.287 | 0.315 | 0.403 |
| 3.589999999999861 | 0.286 | 0.314 | 0.402 |
| 3.594999999999861 | 0.286 | 0.314 | 0.401 |
| 3.599999999999861 | 0.285 | 0.313 | 0.4 |
| 3.604999999999861 | 0.285 | 0.313 | 0.398 |
| 3.609999999999861 | 0.284 | 0.312 | 0.397 |
| 3.614999999999861 | 0.284 | 0.312 | 0.396 |
| 3.619999999999861 | 0.284 | 0.311 | 0.395 |
| 3.62499999999986 | 0.283 | 0.31 | 0.393 |
| 3.62999999999986 | 0.283 | 0.31 | 0.392 |
| 3.63499999999986 | 0.282 | 0.309 | 0.391 |
| 3.63999999999986 | 0.282 | 0.309 | 0.39 |
| 3.64499999999986 | 0.282 | 0.308 | 0.389 |
| 3.64999999999986 | 0.281 | 0.308 | 0.388 |
| 3.65499999999986 | 0.281 | 0.307 | 0.386 |
| 3.65999999999986 | 0.28 | 0.307 | 0.385 |
| 3.66499999999986 | 0.28 | 0.306 | 0.384 |
| 3.669999999999859 | 0.28 | 0.306 | 0.383 |
| 3.674999999999859 | 0.279 | 0.305 | 0.382 |
| 3.679999999999859 | 0.279 | 0.305 | 0.381 |
| 3.684999999999859 | 0.278 | 0.304 | 0.38 |
| 3.689999999999859 | 0.278 | 0.303 | 0.379 |
| 3.694999999999859 | 0.278 | 0.303 | 0.378 |
| 3.699999999999859 | 0.277 | 0.302 | 0.376 |
| 3.704999999999859 | 0.277 | 0.302 | 0.375 |
| 3.709999999999859 | 0.276 | 0.301 | 0.374 |
| 3.714999999999859 | 0.276 | 0.301 | 0.373 |
| 3.719999999999858 | 0.276 | 0.3 | 0.372 |
| 3.724999999999858 | 0.275 | 0.3 | 0.371 |
| 3.729999999999858 | 0.275 | 0.299 | 0.37 |
| 3.734999999999858 | 0.274 | 0.299 | 0.369 |
| 3.739999999999858 | 0.274 | 0.298 | 0.368 |
| 3.744999999999858 | 0.274 | 0.298 | 0.367 |
| 3.749999999999858 | 0.273 | 0.297 | 0.366 |
| 3.754999999999858 | 0.273 | 0.297 | 0.365 |
| 3.759999999999858 | 0.273 | 0.296 | 0.364 |
| 3.764999999999857 | 0.272 | 0.296 | 0.363 |
| 3.769999999999857 | 0.272 | 0.295 | 0.362 |
| 3.774999999999857 | 0.271 | 0.295 | 0.361 |
| 3.779999999999857 | 0.271 | 0.294 | 0.36 |
| 3.784999999999857 | 0.271 | 0.294 | 0.359 |
| 3.789999999999857 | 0.27 | 0.293 | 0.359 |
| 3.794999999999857 | 0.27 | 0.293 | 0.358 |
| 3.799999999999857 | 0.269 | 0.293 | 0.357 |
| 3.804999999999857 | 0.269 | 0.292 | 0.356 |
| 3.809999999999857 | 0.269 | 0.292 | 0.355 |
| 3.814999999999856 | 0.268 | 0.291 | 0.354 |
| 3.819999999999856 | 0.268 | 0.291 | 0.353 |
| 3.824999999999856 | 0.268 | 0.29 | 0.352 |
| 3.829999999999856 | 0.267 | 0.29 | 0.351 |
| 3.834999999999856 | 0.267 | 0.289 | 0.35 |
| 3.839999999999856 | 0.267 | 0.289 | 0.35 |
| 3.844999999999856 | 0.266 | 0.288 | 0.349 |
| 3.849999999999856 | 0.266 | 0.288 | 0.348 |
| 3.854999999999856 | 0.265 | 0.287 | 0.347 |
| 3.859999999999855 | 0.265 | 0.287 | 0.346 |
| 3.864999999999855 | 0.265 | 0.286 | 0.345 |
| 3.869999999999855 | 0.264 | 0.286 | 0.344 |
| 3.874999999999855 | 0.264 | 0.286 | 0.344 |
| 3.879999999999855 | 0.264 | 0.285 | 0.343 |
| 3.884999999999855 | 0.263 | 0.285 | 0.342 |
| 3.889999999999855 | 0.263 | 0.284 | 0.341 |
| 3.894999999999855 | 0.263 | 0.284 | 0.34 |
| 3.899999999999855 | 0.262 | 0.283 | 0.339 |
| 3.904999999999855 | 0.262 | 0.283 | 0.339 |
| 3.909999999999854 | 0.262 | 0.282 | 0.338 |
| 3.914999999999854 | 0.261 | 0.282 | 0.337 |
| 3.919999999999854 | 0.261 | 0.282 | 0.336 |
| 3.924999999999854 | 0.261 | 0.281 | 0.336 |
| 3.929999999999854 | 0.26 | 0.281 | 0.335 |
| 3.934999999999854 | 0.26 | 0.28 | 0.334 |
| 3.939999999999854 | 0.259 | 0.28 | 0.333 |
| 3.944999999999854 | 0.259 | 0.279 | 0.332 |
| 3.949999999999854 | 0.259 | 0.279 | 0.332 |
| 3.954999999999853 | 0.258 | 0.278 | 0.331 |
| 3.959999999999853 | 0.258 | 0.278 | 0.33 |
| 3.964999999999853 | 0.258 | 0.278 | 0.329 |
| 3.969999999999853 | 0.257 | 0.277 | 0.329 |
| 3.974999999999853 | 0.257 | 0.277 | 0.328 |
| 3.979999999999853 | 0.257 | 0.276 | 0.327 |
| 3.984999999999853 | 0.256 | 0.276 | 0.326 |
| 3.989999999999853 | 0.256 | 0.275 | 0.326 |
| 3.994999999999853 | 0.256 | 0.275 | 0.325 |
| 3.999999999999853 | 0.255 | 0.275 | 0.324 |
| 4.004999999999852 | 0.255 | 0.274 | 0.324 |
| 4.009999999999852 | 0.255 | 0.274 | 0.323 |
| 4.014999999999852 | 0.254 | 0.273 | 0.322 |
| 4.019999999999852 | 0.254 | 0.273 | 0.321 |
| 4.024999999999852 | 0.254 | 0.273 | 0.321 |
| 4.029999999999852 | 0.253 | 0.272 | 0.32 |
| 4.034999999999852 | 0.253 | 0.272 | 0.319 |
| 4.039999999999851 | 0.253 | 0.271 | 0.319 |
| 4.044999999999852 | 0.252 | 0.271 | 0.318 |
| 4.049999999999851 | 0.252 | 0.271 | 0.317 |
| 4.054999999999851 | 0.252 | 0.27 | 0.317 |
| 4.059999999999851 | 0.251 | 0.27 | 0.316 |
| 4.064999999999851 | 0.251 | 0.269 | 0.315 |
| 4.069999999999851 | 0.251 | 0.269 | 0.315 |
| 4.074999999999851 | 0.251 | 0.269 | 0.314 |
| 4.07999999999985 | 0.25 | 0.268 | 0.313 |
| 4.084999999999851 | 0.25 | 0.268 | 0.313 |
| 4.08999999999985 | 0.25 | 0.267 | 0.312 |
| 4.094999999999851 | 0.249 | 0.267 | 0.311 |
| 4.09999999999985 | 0.249 | 0.267 | 0.311 |
| 4.10499999999985 | 0.249 | 0.266 | 0.31 |
| 4.10999999999985 | 0.248 | 0.266 | 0.31 |
| 4.11499999999985 | 0.248 | 0.265 | 0.309 |
| 4.11999999999985 | 0.248 | 0.265 | 0.308 |
| 4.12499999999985 | 0.247 | 0.265 | 0.308 |
| 4.12999999999985 | 0.247 | 0.264 | 0.307 |
| 4.13499999999985 | 0.247 | 0.264 | 0.306 |
| 4.13999999999985 | 0.246 | 0.264 | 0.306 |
| 4.144999999999849 | 0.246 | 0.263 | 0.305 |
| 4.14999999999985 | 0.246 | 0.263 | 0.305 |
| 4.154999999999849 | 0.245 | 0.262 | 0.304 |
| 4.15999999999985 | 0.245 | 0.262 | 0.303 |
| 4.164999999999849 | 0.245 | 0.262 | 0.303 |
| 4.169999999999849 | 0.245 | 0.261 | 0.302 |
| 4.174999999999849 | 0.244 | 0.261 | 0.302 |
| 4.179999999999848 | 0.244 | 0.26 | 0.301 |
| 4.184999999999849 | 0.244 | 0.26 | 0.3 |
| 4.189999999999848 | 0.243 | 0.26 | 0.3 |
| 4.194999999999848 | 0.243 | 0.259 | 0.299 |
| 4.199999999999848 | 0.243 | 0.259 | 0.299 |
| 4.204999999999848 | 0.242 | 0.259 | 0.298 |
| 4.209999999999848 | 0.242 | 0.258 | 0.297 |
| 4.214999999999848 | 0.242 | 0.258 | 0.297 |
| 4.219999999999847 | 0.242 | 0.258 | 0.296 |
| 4.224999999999848 | 0.241 | 0.257 | 0.296 |
| 4.229999999999847 | 0.241 | 0.257 | 0.295 |
| 4.234999999999847 | 0.241 | 0.256 | 0.295 |
| 4.239999999999847 | 0.24 | 0.256 | 0.294 |
| 4.244999999999847 | 0.24 | 0.256 | 0.294 |
| 4.249999999999847 | 0.24 | 0.255 | 0.293 |
| 4.254999999999847 | 0.239 | 0.255 | 0.292 |
| 4.259999999999846 | 0.239 | 0.255 | 0.292 |
| 4.264999999999847 | 0.239 | 0.254 | 0.291 |
| 4.269999999999846 | 0.239 | 0.254 | 0.291 |
| 4.274999999999846 | 0.238 | 0.254 | 0.29 |
| 4.279999999999846 | 0.238 | 0.253 | 0.29 |
| 4.284999999999846 | 0.238 | 0.253 | 0.289 |
| 4.289999999999846 | 0.237 | 0.253 | 0.289 |
| 4.294999999999846 | 0.237 | 0.252 | 0.288 |
| 4.299999999999846 | 0.237 | 0.252 | 0.288 |
| 4.304999999999846 | 0.237 | 0.252 | 0.287 |
| 4.309999999999845 | 0.236 | 0.251 | 0.287 |
| 4.314999999999846 | 0.236 | 0.251 | 0.286 |
| 4.319999999999845 | 0.236 | 0.251 | 0.285 |
| 4.324999999999846 | 0.235 | 0.25 | 0.285 |
| 4.329999999999845 | 0.235 | 0.25 | 0.284 |
| 4.334999999999845 | 0.235 | 0.25 | 0.284 |
| 4.339999999999845 | 0.235 | 0.249 | 0.283 |
| 4.344999999999845 | 0.234 | 0.249 | 0.283 |
| 4.349999999999845 | 0.234 | 0.249 | 0.282 |
| 4.354999999999845 | 0.234 | 0.248 | 0.282 |
| 4.359999999999844 | 0.234 | 0.248 | 0.281 |
| 4.364999999999845 | 0.233 | 0.248 | 0.281 |
| 4.369999999999844 | 0.233 | 0.247 | 0.28 |
| 4.374999999999844 | 0.233 | 0.247 | 0.28 |
| 4.379999999999844 | 0.232 | 0.247 | 0.279 |
| 4.384999999999844 | 0.232 | 0.246 | 0.279 |
| 4.389999999999844 | 0.232 | 0.246 | 0.278 |
| 4.394999999999844 | 0.232 | 0.246 | 0.278 |
| 4.399999999999844 | 0.231 | 0.245 | 0.278 |
| 4.404999999999844 | 0.231 | 0.245 | 0.277 |
| 4.409999999999843 | 0.231 | 0.245 | 0.277 |
| 4.414999999999844 | 0.23 | 0.244 | 0.276 |
| 4.419999999999843 | 0.23 | 0.244 | 0.276 |
| 4.424999999999843 | 0.23 | 0.244 | 0.275 |
| 4.429999999999843 | 0.23 | 0.243 | 0.275 |
| 4.434999999999843 | 0.229 | 0.243 | 0.274 |
| 4.439999999999843 | 0.229 | 0.243 | 0.274 |
| 4.444999999999843 | 0.229 | 0.242 | 0.273 |
| 4.449999999999842 | 0.229 | 0.242 | 0.273 |
| 4.454999999999843 | 0.228 | 0.242 | 0.272 |
| 4.459999999999842 | 0.228 | 0.241 | 0.272 |
| 4.464999999999843 | 0.228 | 0.241 | 0.271 |
| 4.469999999999842 | 0.228 | 0.241 | 0.271 |
| 4.474999999999842 | 0.227 | 0.24 | 0.27 |
| 4.479999999999842 | 0.227 | 0.24 | 0.27 |
| 4.484999999999842 | 0.227 | 0.24 | 0.27 |
| 4.489999999999842 | 0.227 | 0.239 | 0.269 |
| 4.494999999999842 | 0.226 | 0.239 | 0.269 |
| 4.499999999999841 | 0.226 | 0.239 | 0.268 |
| 4.504999999999842 | 0.226 | 0.239 | 0.268 |
| 4.509999999999841 | 0.225 | 0.238 | 0.267 |
| 4.514999999999842 | 0.225 | 0.238 | 0.267 |
| 4.519999999999841 | 0.225 | 0.238 | 0.266 |
| 4.524999999999841 | 0.225 | 0.237 | 0.266 |
| 4.529999999999841 | 0.224 | 0.237 | 0.266 |
| 4.534999999999841 | 0.224 | 0.237 | 0.265 |
| 4.53999999999984 | 0.224 | 0.236 | 0.265 |
| 4.544999999999841 | 0.224 | 0.236 | 0.264 |
| 4.54999999999984 | 0.223 | 0.236 | 0.264 |
| 4.554999999999841 | 0.223 | 0.236 | 0.263 |
| 4.55999999999984 | 0.223 | 0.235 | 0.263 |
| 4.564999999999841 | 0.223 | 0.235 | 0.263 |
| 4.56999999999984 | 0.222 | 0.235 | 0.262 |
| 4.57499999999984 | 0.222 | 0.234 | 0.262 |
| 4.57999999999984 | 0.222 | 0.234 | 0.261 |
| 4.58499999999984 | 0.222 | 0.234 | 0.261 |
| 4.58999999999984 | 0.221 | 0.233 | 0.261 |
| 4.59499999999984 | 0.221 | 0.233 | 0.26 |
| 4.59999999999984 | 0.221 | 0.233 | 0.26 |
| 4.60499999999984 | 0.221 | 0.233 | 0.259 |
| 4.60999999999984 | 0.22 | 0.232 | 0.259 |
| 4.614999999999839 | 0.22 | 0.232 | 0.258 |
| 4.61999999999984 | 0.22 | 0.232 | 0.258 |
| 4.624999999999839 | 0.22 | 0.231 | 0.258 |
| 4.62999999999984 | 0.219 | 0.231 | 0.257 |
| 4.634999999999839 | 0.219 | 0.231 | 0.257 |
| 4.639999999999838 | 0.219 | 0.231 | 0.256 |
| 4.644999999999839 | 0.219 | 0.23 | 0.256 |
| 4.649999999999838 | 0.218 | 0.23 | 0.256 |
| 4.654999999999839 | 0.218 | 0.23 | 0.255 |
| 4.659999999999838 | 0.218 | 0.229 | 0.255 |
| 4.664999999999838 | 0.218 | 0.229 | 0.254 |
| 4.669999999999838 | 0.217 | 0.229 | 0.254 |
| 4.674999999999838 | 0.217 | 0.229 | 0.254 |
| 4.679999999999837 | 0.217 | 0.228 | 0.253 |
| 4.684999999999838 | 0.217 | 0.228 | 0.253 |
| 4.689999999999837 | 0.217 | 0.228 | 0.253 |
| 4.694999999999838 | 0.216 | 0.227 | 0.252 |
| 4.699999999999837 | 0.216 | 0.227 | 0.252 |
| 4.704999999999837 | 0.216 | 0.227 | 0.251 |
| 4.709999999999837 | 0.216 | 0.227 | 0.251 |
| 4.714999999999837 | 0.215 | 0.226 | 0.251 |
| 4.719999999999837 | 0.215 | 0.226 | 0.25 |
| 4.724999999999837 | 0.215 | 0.226 | 0.25 |
| 4.729999999999836 | 0.215 | 0.226 | 0.249 |
| 4.734999999999836 | 0.214 | 0.225 | 0.249 |
| 4.739999999999836 | 0.214 | 0.225 | 0.249 |
| 4.744999999999836 | 0.214 | 0.225 | 0.248 |
| 4.749999999999836 | 0.214 | 0.224 | 0.248 |
| 4.754999999999836 | 0.213 | 0.224 | 0.248 |
| 4.759999999999836 | 0.213 | 0.224 | 0.247 |
| 4.764999999999836 | 0.213 | 0.224 | 0.247 |
| 4.769999999999836 | 0.213 | 0.223 | 0.247 |
| 4.774999999999835 | 0.213 | 0.223 | 0.246 |
| 4.779999999999835 | 0.212 | 0.223 | 0.246 |
| 4.784999999999835 | 0.212 | 0.223 | 0.245 |
| 4.789999999999835 | 0.212 | 0.222 | 0.245 |
| 4.794999999999835 | 0.212 | 0.222 | 0.245 |
| 4.799999999999835 | 0.211 | 0.222 | 0.244 |
| 4.804999999999835 | 0.211 | 0.222 | 0.244 |
| 4.809999999999835 | 0.211 | 0.221 | 0.244 |
| 4.814999999999835 | 0.211 | 0.221 | 0.243 |
| 4.819999999999835 | 0.211 | 0.221 | 0.243 |
| 4.824999999999835 | 0.21 | 0.221 | 0.243 |
| 4.829999999999834 | 0.21 | 0.22 | 0.242 |
| 4.834999999999834 | 0.21 | 0.22 | 0.242 |
| 4.839999999999834 | 0.21 | 0.22 | 0.242 |
| 4.844999999999834 | 0.209 | 0.219 | 0.241 |
| 4.849999999999834 | 0.209 | 0.219 | 0.241 |
| 4.854999999999834 | 0.209 | 0.219 | 0.241 |
| 4.859999999999834 | 0.209 | 0.219 | 0.24 |
| 4.864999999999834 | 0.209 | 0.218 | 0.24 |
| 4.869999999999834 | 0.208 | 0.218 | 0.24 |
| 4.874999999999834 | 0.208 | 0.218 | 0.239 |
| 4.879999999999833 | 0.208 | 0.218 | 0.239 |
| 4.884999999999834 | 0.208 | 0.217 | 0.239 |
| 4.889999999999833 | 0.207 | 0.217 | 0.238 |
| 4.894999999999833 | 0.207 | 0.217 | 0.238 |
| 4.899999999999833 | 0.207 | 0.217 | 0.238 |
| 4.904999999999833 | 0.207 | 0.216 | 0.237 |
| 4.909999999999833 | 0.207 | 0.216 | 0.237 |
| 4.914999999999833 | 0.206 | 0.216 | 0.237 |
| 4.919999999999832 | 0.206 | 0.216 | 0.236 |
| 4.924999999999833 | 0.206 | 0.215 | 0.236 |
| 4.929999999999832 | 0.206 | 0.215 | 0.236 |
| 4.934999999999832 | 0.205 | 0.215 | 0.235 |
| 4.939999999999832 | 0.205 | 0.215 | 0.235 |
| 4.944999999999832 | 0.205 | 0.214 | 0.235 |
| 4.949999999999832 | 0.205 | 0.214 | 0.234 |
| 4.954999999999832 | 0.205 | 0.214 | 0.234 |
| 4.959999999999832 | 0.204 | 0.214 | 0.234 |
| 4.964999999999832 | 0.204 | 0.214 | 0.233 |
| 4.969999999999831 | 0.204 | 0.213 | 0.233 |
| 4.974999999999831 | 0.204 | 0.213 | 0.233 |
| 4.97999999999983 | 0.204 | 0.213 | 0.232 |
| 4.984999999999831 | 0.203 | 0.213 | 0.232 |
| 4.98999999999983 | 0.203 | 0.212 | 0.232 |
| 4.994999999999831 | 0.203 | 0.212 | 0.231 |
| 4.99999999999983 | 0.203 | 0.212 | 0.231 |